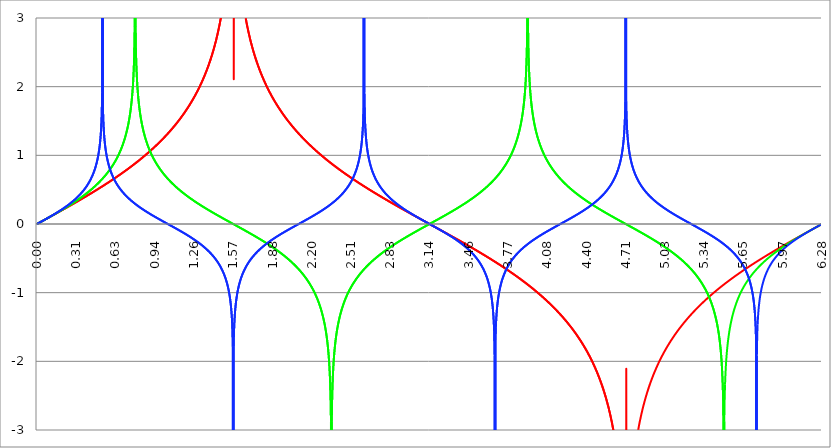
| Category | Series 1 | Series 0 | Series 2 |
|---|---|---|---|
| 0.0 | 0 | 0 | 0 |
| 0.00314159265358979 | 0.003 | 0.003 | 0.003 |
| 0.00628318530717958 | 0.006 | 0.006 | 0.006 |
| 0.00942477796076938 | 0.009 | 0.009 | 0.009 |
| 0.0125663706143592 | 0.013 | 0.013 | 0.013 |
| 0.015707963267949 | 0.016 | 0.016 | 0.016 |
| 0.0188495559215388 | 0.019 | 0.019 | 0.019 |
| 0.0219911485751285 | 0.022 | 0.022 | 0.022 |
| 0.0251327412287183 | 0.025 | 0.025 | 0.025 |
| 0.0282743338823081 | 0.028 | 0.028 | 0.028 |
| 0.0314159265358979 | 0.031 | 0.031 | 0.031 |
| 0.0345575191894877 | 0.035 | 0.035 | 0.035 |
| 0.0376991118430775 | 0.038 | 0.038 | 0.038 |
| 0.0408407044966673 | 0.041 | 0.041 | 0.041 |
| 0.0439822971502571 | 0.044 | 0.044 | 0.044 |
| 0.0471238898038469 | 0.047 | 0.047 | 0.047 |
| 0.0502654824574367 | 0.05 | 0.05 | 0.05 |
| 0.0534070751110265 | 0.053 | 0.054 | 0.054 |
| 0.0565486677646163 | 0.057 | 0.057 | 0.057 |
| 0.059690260418206 | 0.06 | 0.06 | 0.06 |
| 0.0628318530717958 | 0.063 | 0.063 | 0.063 |
| 0.0659734457253856 | 0.066 | 0.066 | 0.066 |
| 0.0691150383789754 | 0.069 | 0.069 | 0.07 |
| 0.0722566310325652 | 0.072 | 0.073 | 0.073 |
| 0.075398223686155 | 0.075 | 0.076 | 0.076 |
| 0.0785398163397448 | 0.079 | 0.079 | 0.079 |
| 0.0816814089933346 | 0.082 | 0.082 | 0.083 |
| 0.0848230016469244 | 0.085 | 0.085 | 0.086 |
| 0.0879645943005142 | 0.088 | 0.088 | 0.089 |
| 0.091106186954104 | 0.091 | 0.092 | 0.092 |
| 0.0942477796076937 | 0.094 | 0.095 | 0.096 |
| 0.0973893722612835 | 0.098 | 0.098 | 0.099 |
| 0.100530964914873 | 0.101 | 0.101 | 0.102 |
| 0.103672557568463 | 0.104 | 0.104 | 0.105 |
| 0.106814150222053 | 0.107 | 0.108 | 0.109 |
| 0.109955742875643 | 0.11 | 0.111 | 0.112 |
| 0.113097335529233 | 0.113 | 0.114 | 0.115 |
| 0.116238928182822 | 0.117 | 0.117 | 0.119 |
| 0.119380520836412 | 0.12 | 0.121 | 0.122 |
| 0.122522113490002 | 0.123 | 0.124 | 0.125 |
| 0.125663706143592 | 0.126 | 0.127 | 0.129 |
| 0.128805298797181 | 0.129 | 0.13 | 0.132 |
| 0.131946891450771 | 0.132 | 0.134 | 0.136 |
| 0.135088484104361 | 0.136 | 0.137 | 0.139 |
| 0.138230076757951 | 0.139 | 0.14 | 0.142 |
| 0.141371669411541 | 0.142 | 0.143 | 0.146 |
| 0.14451326206513 | 0.145 | 0.147 | 0.149 |
| 0.14765485471872 | 0.148 | 0.15 | 0.153 |
| 0.15079644737231 | 0.151 | 0.153 | 0.156 |
| 0.1539380400259 | 0.155 | 0.156 | 0.16 |
| 0.15707963267949 | 0.158 | 0.16 | 0.163 |
| 0.160221225333079 | 0.161 | 0.163 | 0.167 |
| 0.163362817986669 | 0.164 | 0.166 | 0.17 |
| 0.166504410640259 | 0.167 | 0.17 | 0.174 |
| 0.169646003293849 | 0.17 | 0.173 | 0.177 |
| 0.172787595947439 | 0.174 | 0.176 | 0.181 |
| 0.175929188601028 | 0.177 | 0.18 | 0.185 |
| 0.179070781254618 | 0.18 | 0.183 | 0.188 |
| 0.182212373908208 | 0.183 | 0.186 | 0.192 |
| 0.185353966561798 | 0.186 | 0.19 | 0.196 |
| 0.188495559215388 | 0.19 | 0.193 | 0.199 |
| 0.191637151868977 | 0.193 | 0.197 | 0.203 |
| 0.194778744522567 | 0.196 | 0.2 | 0.207 |
| 0.197920337176157 | 0.199 | 0.203 | 0.211 |
| 0.201061929829747 | 0.202 | 0.207 | 0.214 |
| 0.204203522483336 | 0.206 | 0.21 | 0.218 |
| 0.207345115136926 | 0.209 | 0.214 | 0.222 |
| 0.210486707790516 | 0.212 | 0.217 | 0.226 |
| 0.213628300444106 | 0.215 | 0.22 | 0.23 |
| 0.216769893097696 | 0.218 | 0.224 | 0.234 |
| 0.219911485751285 | 0.222 | 0.227 | 0.238 |
| 0.223053078404875 | 0.225 | 0.231 | 0.242 |
| 0.226194671058465 | 0.228 | 0.234 | 0.246 |
| 0.229336263712055 | 0.231 | 0.238 | 0.25 |
| 0.232477856365645 | 0.235 | 0.241 | 0.254 |
| 0.235619449019234 | 0.238 | 0.245 | 0.258 |
| 0.238761041672824 | 0.241 | 0.248 | 0.262 |
| 0.241902634326414 | 0.244 | 0.252 | 0.266 |
| 0.245044226980004 | 0.248 | 0.255 | 0.271 |
| 0.248185819633594 | 0.251 | 0.259 | 0.275 |
| 0.251327412287183 | 0.254 | 0.263 | 0.279 |
| 0.254469004940773 | 0.257 | 0.266 | 0.284 |
| 0.257610597594363 | 0.261 | 0.27 | 0.288 |
| 0.260752190247953 | 0.264 | 0.273 | 0.292 |
| 0.263893782901543 | 0.267 | 0.277 | 0.297 |
| 0.267035375555132 | 0.27 | 0.281 | 0.301 |
| 0.270176968208722 | 0.274 | 0.284 | 0.306 |
| 0.273318560862312 | 0.277 | 0.288 | 0.31 |
| 0.276460153515902 | 0.28 | 0.292 | 0.315 |
| 0.279601746169492 | 0.283 | 0.295 | 0.32 |
| 0.282743338823082 | 0.287 | 0.299 | 0.324 |
| 0.285884931476671 | 0.29 | 0.303 | 0.329 |
| 0.289026524130261 | 0.293 | 0.307 | 0.334 |
| 0.292168116783851 | 0.296 | 0.31 | 0.339 |
| 0.295309709437441 | 0.3 | 0.314 | 0.344 |
| 0.298451302091031 | 0.303 | 0.318 | 0.349 |
| 0.30159289474462 | 0.306 | 0.322 | 0.354 |
| 0.30473448739821 | 0.31 | 0.326 | 0.359 |
| 0.3078760800518 | 0.313 | 0.329 | 0.364 |
| 0.31101767270539 | 0.316 | 0.333 | 0.369 |
| 0.31415926535898 | 0.319 | 0.337 | 0.375 |
| 0.31730085801257 | 0.323 | 0.341 | 0.38 |
| 0.320442450666159 | 0.326 | 0.345 | 0.386 |
| 0.323584043319749 | 0.329 | 0.349 | 0.391 |
| 0.326725635973339 | 0.333 | 0.353 | 0.397 |
| 0.329867228626929 | 0.336 | 0.357 | 0.402 |
| 0.333008821280519 | 0.339 | 0.361 | 0.408 |
| 0.336150413934108 | 0.343 | 0.365 | 0.414 |
| 0.339292006587698 | 0.346 | 0.369 | 0.42 |
| 0.342433599241288 | 0.349 | 0.373 | 0.426 |
| 0.345575191894878 | 0.353 | 0.377 | 0.432 |
| 0.348716784548468 | 0.356 | 0.381 | 0.438 |
| 0.351858377202058 | 0.359 | 0.385 | 0.445 |
| 0.354999969855647 | 0.363 | 0.389 | 0.451 |
| 0.358141562509237 | 0.366 | 0.393 | 0.458 |
| 0.361283155162827 | 0.369 | 0.398 | 0.464 |
| 0.364424747816417 | 0.373 | 0.402 | 0.471 |
| 0.367566340470007 | 0.376 | 0.406 | 0.478 |
| 0.370707933123597 | 0.38 | 0.41 | 0.485 |
| 0.373849525777186 | 0.383 | 0.415 | 0.492 |
| 0.376991118430776 | 0.386 | 0.419 | 0.499 |
| 0.380132711084366 | 0.39 | 0.423 | 0.507 |
| 0.383274303737956 | 0.393 | 0.427 | 0.514 |
| 0.386415896391546 | 0.396 | 0.432 | 0.522 |
| 0.389557489045135 | 0.4 | 0.436 | 0.53 |
| 0.392699081698725 | 0.403 | 0.441 | 0.538 |
| 0.395840674352315 | 0.407 | 0.445 | 0.547 |
| 0.398982267005905 | 0.41 | 0.45 | 0.555 |
| 0.402123859659495 | 0.413 | 0.454 | 0.564 |
| 0.405265452313085 | 0.417 | 0.459 | 0.573 |
| 0.408407044966674 | 0.42 | 0.463 | 0.582 |
| 0.411548637620264 | 0.424 | 0.468 | 0.591 |
| 0.414690230273854 | 0.427 | 0.473 | 0.601 |
| 0.417831822927444 | 0.431 | 0.477 | 0.611 |
| 0.420973415581034 | 0.434 | 0.482 | 0.621 |
| 0.424115008234623 | 0.437 | 0.487 | 0.632 |
| 0.427256600888213 | 0.441 | 0.491 | 0.642 |
| 0.430398193541803 | 0.444 | 0.496 | 0.654 |
| 0.433539786195393 | 0.448 | 0.501 | 0.665 |
| 0.436681378848983 | 0.451 | 0.506 | 0.677 |
| 0.439822971502573 | 0.455 | 0.511 | 0.69 |
| 0.442964564156162 | 0.458 | 0.516 | 0.702 |
| 0.446106156809752 | 0.462 | 0.521 | 0.716 |
| 0.449247749463342 | 0.465 | 0.526 | 0.73 |
| 0.452389342116932 | 0.469 | 0.531 | 0.744 |
| 0.455530934770522 | 0.472 | 0.536 | 0.759 |
| 0.458672527424111 | 0.476 | 0.541 | 0.775 |
| 0.461814120077701 | 0.479 | 0.546 | 0.792 |
| 0.464955712731291 | 0.483 | 0.551 | 0.809 |
| 0.468097305384881 | 0.486 | 0.557 | 0.828 |
| 0.471238898038471 | 0.49 | 0.562 | 0.847 |
| 0.474380490692061 | 0.493 | 0.567 | 0.868 |
| 0.47752208334565 | 0.497 | 0.573 | 0.89 |
| 0.48066367599924 | 0.5 | 0.578 | 0.914 |
| 0.48380526865283 | 0.504 | 0.584 | 0.939 |
| 0.48694686130642 | 0.507 | 0.589 | 0.967 |
| 0.49008845396001 | 0.511 | 0.595 | 0.997 |
| 0.493230046613599 | 0.515 | 0.601 | 1.029 |
| 0.496371639267189 | 0.518 | 0.606 | 1.066 |
| 0.499513231920779 | 0.522 | 0.612 | 1.107 |
| 0.502654824574369 | 0.525 | 0.618 | 1.153 |
| 0.505796417227959 | 0.529 | 0.624 | 1.208 |
| 0.508938009881549 | 0.532 | 0.63 | 1.272 |
| 0.512079602535138 | 0.536 | 0.636 | 1.353 |
| 0.515221195188728 | 0.54 | 0.642 | 1.459 |
| 0.518362787842318 | 0.543 | 0.648 | 1.616 |
| 0.521504380495908 | 0.547 | 0.654 | 1.921 |
| 0.524645973149498 | 0.551 | 0.661 | 100 |
| 0.527787565803087 | 0.554 | 0.667 | 1.69 |
| 0.530929158456677 | 0.558 | 0.673 | 1.503 |
| 0.534070751110267 | 0.561 | 0.68 | 1.385 |
| 0.537212343763857 | 0.565 | 0.686 | 1.297 |
| 0.540353936417447 | 0.569 | 0.693 | 1.228 |
| 0.543495529071037 | 0.572 | 0.7 | 1.17 |
| 0.546637121724626 | 0.576 | 0.707 | 1.122 |
| 0.549778714378216 | 0.58 | 0.713 | 1.079 |
| 0.552920307031806 | 0.583 | 0.72 | 1.041 |
| 0.556061899685396 | 0.587 | 0.727 | 1.007 |
| 0.559203492338986 | 0.591 | 0.735 | 0.976 |
| 0.562345084992576 | 0.595 | 0.742 | 0.948 |
| 0.565486677646165 | 0.598 | 0.749 | 0.922 |
| 0.568628270299755 | 0.602 | 0.757 | 0.898 |
| 0.571769862953345 | 0.606 | 0.764 | 0.875 |
| 0.574911455606935 | 0.609 | 0.772 | 0.854 |
| 0.578053048260525 | 0.613 | 0.779 | 0.834 |
| 0.581194640914114 | 0.617 | 0.787 | 0.815 |
| 0.584336233567704 | 0.621 | 0.795 | 0.798 |
| 0.587477826221294 | 0.625 | 0.803 | 0.781 |
| 0.590619418874884 | 0.628 | 0.812 | 0.765 |
| 0.593761011528474 | 0.632 | 0.82 | 0.749 |
| 0.596902604182064 | 0.636 | 0.828 | 0.735 |
| 0.600044196835653 | 0.64 | 0.837 | 0.72 |
| 0.603185789489243 | 0.643 | 0.846 | 0.707 |
| 0.606327382142833 | 0.647 | 0.855 | 0.694 |
| 0.609468974796423 | 0.651 | 0.864 | 0.681 |
| 0.612610567450013 | 0.655 | 0.873 | 0.669 |
| 0.615752160103602 | 0.659 | 0.882 | 0.657 |
| 0.618893752757192 | 0.663 | 0.892 | 0.646 |
| 0.622035345410782 | 0.667 | 0.901 | 0.635 |
| 0.625176938064372 | 0.67 | 0.911 | 0.625 |
| 0.628318530717962 | 0.674 | 0.921 | 0.614 |
| 0.631460123371551 | 0.678 | 0.932 | 0.604 |
| 0.634601716025141 | 0.682 | 0.942 | 0.594 |
| 0.637743308678731 | 0.686 | 0.953 | 0.585 |
| 0.640884901332321 | 0.69 | 0.964 | 0.576 |
| 0.644026493985911 | 0.694 | 0.975 | 0.567 |
| 0.647168086639501 | 0.698 | 0.986 | 0.558 |
| 0.65030967929309 | 0.702 | 0.998 | 0.549 |
| 0.65345127194668 | 0.706 | 1.01 | 0.541 |
| 0.65659286460027 | 0.71 | 1.022 | 0.533 |
| 0.65973445725386 | 0.714 | 1.034 | 0.525 |
| 0.66287604990745 | 0.718 | 1.047 | 0.517 |
| 0.666017642561039 | 0.722 | 1.06 | 0.509 |
| 0.669159235214629 | 0.726 | 1.074 | 0.502 |
| 0.672300827868219 | 0.73 | 1.088 | 0.495 |
| 0.675442420521809 | 0.734 | 1.102 | 0.487 |
| 0.678584013175399 | 0.738 | 1.116 | 0.48 |
| 0.681725605828989 | 0.742 | 1.131 | 0.473 |
| 0.684867198482578 | 0.746 | 1.147 | 0.466 |
| 0.688008791136168 | 0.75 | 1.163 | 0.46 |
| 0.691150383789758 | 0.754 | 1.179 | 0.453 |
| 0.694291976443348 | 0.758 | 1.196 | 0.447 |
| 0.697433569096938 | 0.762 | 1.214 | 0.44 |
| 0.700575161750528 | 0.766 | 1.232 | 0.434 |
| 0.703716754404117 | 0.77 | 1.251 | 0.428 |
| 0.706858347057707 | 0.774 | 1.271 | 0.422 |
| 0.709999939711297 | 0.778 | 1.292 | 0.416 |
| 0.713141532364887 | 0.783 | 1.313 | 0.41 |
| 0.716283125018477 | 0.787 | 1.335 | 0.404 |
| 0.719424717672066 | 0.791 | 1.359 | 0.399 |
| 0.722566310325656 | 0.795 | 1.383 | 0.393 |
| 0.725707902979246 | 0.799 | 1.409 | 0.387 |
| 0.728849495632836 | 0.804 | 1.436 | 0.382 |
| 0.731991088286426 | 0.808 | 1.464 | 0.377 |
| 0.735132680940016 | 0.812 | 1.495 | 0.371 |
| 0.738274273593605 | 0.816 | 1.527 | 0.366 |
| 0.741415866247195 | 0.82 | 1.562 | 0.361 |
| 0.744557458900785 | 0.825 | 1.599 | 0.356 |
| 0.747699051554375 | 0.829 | 1.639 | 0.351 |
| 0.750840644207965 | 0.833 | 1.682 | 0.345 |
| 0.753982236861554 | 0.838 | 1.73 | 0.341 |
| 0.757123829515144 | 0.842 | 1.783 | 0.336 |
| 0.760265422168734 | 0.846 | 1.842 | 0.331 |
| 0.763407014822324 | 0.851 | 1.908 | 0.326 |
| 0.766548607475914 | 0.855 | 1.986 | 0.321 |
| 0.769690200129504 | 0.859 | 2.077 | 0.317 |
| 0.772831792783093 | 0.864 | 2.188 | 0.312 |
| 0.775973385436683 | 0.868 | 2.332 | 0.307 |
| 0.779114978090273 | 0.873 | 2.535 | 0.303 |
| 0.782256570743863 | 0.877 | 2.882 | 0.298 |
| 0.785398163397453 | 0.881 | 100 | 0.294 |
| 0.788539756051042 | 0.886 | 2.882 | 0.289 |
| 0.791681348704632 | 0.89 | 2.535 | 0.285 |
| 0.794822941358222 | 0.895 | 2.332 | 0.281 |
| 0.797964534011812 | 0.899 | 2.188 | 0.276 |
| 0.801106126665402 | 0.904 | 2.077 | 0.272 |
| 0.804247719318992 | 0.908 | 1.986 | 0.268 |
| 0.807389311972581 | 0.913 | 1.908 | 0.264 |
| 0.810530904626171 | 0.917 | 1.842 | 0.259 |
| 0.813672497279761 | 0.922 | 1.783 | 0.255 |
| 0.816814089933351 | 0.927 | 1.73 | 0.251 |
| 0.819955682586941 | 0.931 | 1.682 | 0.247 |
| 0.823097275240531 | 0.936 | 1.639 | 0.243 |
| 0.82623886789412 | 0.94 | 1.599 | 0.239 |
| 0.82938046054771 | 0.945 | 1.562 | 0.235 |
| 0.8325220532013 | 0.95 | 1.527 | 0.231 |
| 0.83566364585489 | 0.954 | 1.495 | 0.227 |
| 0.83880523850848 | 0.959 | 1.464 | 0.223 |
| 0.841946831162069 | 0.964 | 1.436 | 0.22 |
| 0.845088423815659 | 0.968 | 1.409 | 0.216 |
| 0.848230016469249 | 0.973 | 1.383 | 0.212 |
| 0.851371609122839 | 0.978 | 1.359 | 0.208 |
| 0.854513201776429 | 0.983 | 1.335 | 0.204 |
| 0.857654794430019 | 0.988 | 1.313 | 0.201 |
| 0.860796387083608 | 0.992 | 1.292 | 0.197 |
| 0.863937979737198 | 0.997 | 1.271 | 0.193 |
| 0.867079572390788 | 1.002 | 1.251 | 0.19 |
| 0.870221165044378 | 1.007 | 1.232 | 0.186 |
| 0.873362757697968 | 1.012 | 1.214 | 0.182 |
| 0.876504350351557 | 1.017 | 1.196 | 0.179 |
| 0.879645943005147 | 1.022 | 1.179 | 0.175 |
| 0.882787535658737 | 1.027 | 1.163 | 0.172 |
| 0.885929128312327 | 1.031 | 1.147 | 0.168 |
| 0.889070720965917 | 1.036 | 1.131 | 0.164 |
| 0.892212313619507 | 1.041 | 1.116 | 0.161 |
| 0.895353906273096 | 1.046 | 1.102 | 0.157 |
| 0.898495498926686 | 1.052 | 1.088 | 0.154 |
| 0.901637091580276 | 1.057 | 1.074 | 0.15 |
| 0.904778684233866 | 1.062 | 1.06 | 0.147 |
| 0.907920276887456 | 1.067 | 1.047 | 0.144 |
| 0.911061869541045 | 1.072 | 1.034 | 0.14 |
| 0.914203462194635 | 1.077 | 1.022 | 0.137 |
| 0.917345054848225 | 1.082 | 1.01 | 0.133 |
| 0.920486647501815 | 1.087 | 0.998 | 0.13 |
| 0.923628240155405 | 1.093 | 0.986 | 0.127 |
| 0.926769832808995 | 1.098 | 0.975 | 0.123 |
| 0.929911425462584 | 1.103 | 0.964 | 0.12 |
| 0.933053018116174 | 1.108 | 0.953 | 0.116 |
| 0.936194610769764 | 1.114 | 0.942 | 0.113 |
| 0.939336203423354 | 1.119 | 0.932 | 0.11 |
| 0.942477796076944 | 1.124 | 0.921 | 0.106 |
| 0.945619388730533 | 1.13 | 0.911 | 0.103 |
| 0.948760981384123 | 1.135 | 0.901 | 0.1 |
| 0.951902574037713 | 1.14 | 0.892 | 0.097 |
| 0.955044166691303 | 1.146 | 0.882 | 0.093 |
| 0.958185759344893 | 1.151 | 0.873 | 0.09 |
| 0.961327351998483 | 1.157 | 0.864 | 0.087 |
| 0.964468944652072 | 1.162 | 0.855 | 0.084 |
| 0.967610537305662 | 1.168 | 0.846 | 0.08 |
| 0.970752129959252 | 1.173 | 0.837 | 0.077 |
| 0.973893722612842 | 1.179 | 0.828 | 0.074 |
| 0.977035315266432 | 1.184 | 0.82 | 0.071 |
| 0.980176907920022 | 1.19 | 0.812 | 0.067 |
| 0.983318500573611 | 1.196 | 0.803 | 0.064 |
| 0.986460093227201 | 1.201 | 0.795 | 0.061 |
| 0.989601685880791 | 1.207 | 0.787 | 0.058 |
| 0.992743278534381 | 1.213 | 0.779 | 0.055 |
| 0.995884871187971 | 1.219 | 0.772 | 0.052 |
| 0.99902646384156 | 1.224 | 0.764 | 0.048 |
| 1.00216805649515 | 1.23 | 0.757 | 0.045 |
| 1.00530964914874 | 1.236 | 0.749 | 0.042 |
| 1.00845124180233 | 1.242 | 0.742 | 0.039 |
| 1.01159283445592 | 1.248 | 0.735 | 0.036 |
| 1.01473442710951 | 1.254 | 0.727 | 0.033 |
| 1.017876019763099 | 1.26 | 0.72 | 0.029 |
| 1.021017612416689 | 1.266 | 0.713 | 0.026 |
| 1.02415920507028 | 1.272 | 0.707 | 0.023 |
| 1.027300797723869 | 1.278 | 0.7 | 0.02 |
| 1.030442390377459 | 1.284 | 0.693 | 0.017 |
| 1.033583983031048 | 1.29 | 0.686 | 0.014 |
| 1.036725575684638 | 1.296 | 0.68 | 0.01 |
| 1.039867168338228 | 1.302 | 0.673 | 0.007 |
| 1.043008760991818 | 1.309 | 0.667 | 0.004 |
| 1.046150353645408 | 1.315 | 0.661 | 0.001 |
| 1.049291946298998 | 1.321 | 0.654 | -0.002 |
| 1.052433538952587 | 1.327 | 0.648 | -0.005 |
| 1.055575131606177 | 1.334 | 0.642 | -0.008 |
| 1.058716724259767 | 1.34 | 0.636 | -0.012 |
| 1.061858316913357 | 1.347 | 0.63 | -0.015 |
| 1.064999909566947 | 1.353 | 0.624 | -0.018 |
| 1.068141502220536 | 1.36 | 0.618 | -0.021 |
| 1.071283094874126 | 1.366 | 0.612 | -0.024 |
| 1.074424687527716 | 1.373 | 0.606 | -0.027 |
| 1.077566280181306 | 1.379 | 0.601 | -0.03 |
| 1.080707872834896 | 1.386 | 0.595 | -0.034 |
| 1.083849465488486 | 1.393 | 0.589 | -0.037 |
| 1.086991058142075 | 1.399 | 0.584 | -0.04 |
| 1.090132650795665 | 1.406 | 0.578 | -0.043 |
| 1.093274243449255 | 1.413 | 0.573 | -0.046 |
| 1.096415836102845 | 1.42 | 0.567 | -0.049 |
| 1.099557428756435 | 1.427 | 0.562 | -0.053 |
| 1.102699021410025 | 1.434 | 0.557 | -0.056 |
| 1.105840614063614 | 1.441 | 0.551 | -0.059 |
| 1.108982206717204 | 1.448 | 0.546 | -0.062 |
| 1.112123799370794 | 1.455 | 0.541 | -0.065 |
| 1.115265392024384 | 1.462 | 0.536 | -0.069 |
| 1.118406984677974 | 1.469 | 0.531 | -0.072 |
| 1.121548577331563 | 1.476 | 0.526 | -0.075 |
| 1.124690169985153 | 1.484 | 0.521 | -0.078 |
| 1.127831762638743 | 1.491 | 0.516 | -0.081 |
| 1.130973355292333 | 1.498 | 0.511 | -0.085 |
| 1.134114947945923 | 1.506 | 0.506 | -0.088 |
| 1.137256540599513 | 1.513 | 0.501 | -0.091 |
| 1.140398133253102 | 1.521 | 0.496 | -0.094 |
| 1.143539725906692 | 1.528 | 0.491 | -0.098 |
| 1.146681318560282 | 1.536 | 0.487 | -0.101 |
| 1.149822911213872 | 1.543 | 0.482 | -0.104 |
| 1.152964503867462 | 1.551 | 0.477 | -0.108 |
| 1.156106096521051 | 1.559 | 0.473 | -0.111 |
| 1.159247689174641 | 1.567 | 0.468 | -0.114 |
| 1.162389281828231 | 1.575 | 0.463 | -0.118 |
| 1.165530874481821 | 1.583 | 0.459 | -0.121 |
| 1.168672467135411 | 1.591 | 0.454 | -0.124 |
| 1.171814059789001 | 1.599 | 0.45 | -0.128 |
| 1.17495565244259 | 1.607 | 0.445 | -0.131 |
| 1.17809724509618 | 1.615 | 0.441 | -0.134 |
| 1.18123883774977 | 1.623 | 0.436 | -0.138 |
| 1.18438043040336 | 1.631 | 0.432 | -0.141 |
| 1.18752202305695 | 1.64 | 0.427 | -0.145 |
| 1.190663615710539 | 1.648 | 0.423 | -0.148 |
| 1.193805208364129 | 1.657 | 0.419 | -0.152 |
| 1.19694680101772 | 1.665 | 0.415 | -0.155 |
| 1.200088393671309 | 1.674 | 0.41 | -0.159 |
| 1.203229986324899 | 1.683 | 0.406 | -0.162 |
| 1.206371578978489 | 1.691 | 0.402 | -0.166 |
| 1.209513171632078 | 1.7 | 0.398 | -0.169 |
| 1.212654764285668 | 1.709 | 0.393 | -0.173 |
| 1.215796356939258 | 1.718 | 0.389 | -0.176 |
| 1.218937949592848 | 1.727 | 0.385 | -0.18 |
| 1.222079542246438 | 1.736 | 0.381 | -0.184 |
| 1.225221134900027 | 1.746 | 0.377 | -0.187 |
| 1.228362727553617 | 1.755 | 0.373 | -0.191 |
| 1.231504320207207 | 1.764 | 0.369 | -0.194 |
| 1.234645912860797 | 1.774 | 0.365 | -0.198 |
| 1.237787505514387 | 1.783 | 0.361 | -0.202 |
| 1.240929098167977 | 1.793 | 0.357 | -0.206 |
| 1.244070690821566 | 1.803 | 0.353 | -0.209 |
| 1.247212283475156 | 1.813 | 0.349 | -0.213 |
| 1.250353876128746 | 1.823 | 0.345 | -0.217 |
| 1.253495468782336 | 1.833 | 0.341 | -0.221 |
| 1.256637061435926 | 1.843 | 0.337 | -0.225 |
| 1.259778654089515 | 1.853 | 0.333 | -0.229 |
| 1.262920246743105 | 1.863 | 0.329 | -0.233 |
| 1.266061839396695 | 1.874 | 0.326 | -0.237 |
| 1.269203432050285 | 1.884 | 0.322 | -0.241 |
| 1.272345024703875 | 1.895 | 0.318 | -0.245 |
| 1.275486617357465 | 1.906 | 0.314 | -0.249 |
| 1.278628210011054 | 1.916 | 0.31 | -0.253 |
| 1.281769802664644 | 1.927 | 0.307 | -0.257 |
| 1.284911395318234 | 1.938 | 0.303 | -0.261 |
| 1.288052987971824 | 1.95 | 0.299 | -0.265 |
| 1.291194580625414 | 1.961 | 0.295 | -0.269 |
| 1.294336173279003 | 1.972 | 0.292 | -0.273 |
| 1.297477765932593 | 1.984 | 0.288 | -0.278 |
| 1.300619358586183 | 1.996 | 0.284 | -0.282 |
| 1.303760951239773 | 2.008 | 0.281 | -0.286 |
| 1.306902543893363 | 2.02 | 0.277 | -0.291 |
| 1.310044136546953 | 2.032 | 0.273 | -0.295 |
| 1.313185729200542 | 2.044 | 0.27 | -0.3 |
| 1.316327321854132 | 2.056 | 0.266 | -0.304 |
| 1.319468914507722 | 2.069 | 0.263 | -0.309 |
| 1.322610507161312 | 2.082 | 0.259 | -0.313 |
| 1.325752099814902 | 2.094 | 0.255 | -0.318 |
| 1.328893692468491 | 2.107 | 0.252 | -0.323 |
| 1.332035285122081 | 2.121 | 0.248 | -0.328 |
| 1.335176877775671 | 2.134 | 0.245 | -0.332 |
| 1.338318470429261 | 2.148 | 0.241 | -0.337 |
| 1.341460063082851 | 2.161 | 0.238 | -0.342 |
| 1.344601655736441 | 2.175 | 0.234 | -0.347 |
| 1.34774324839003 | 2.189 | 0.231 | -0.352 |
| 1.35088484104362 | 2.204 | 0.227 | -0.357 |
| 1.35402643369721 | 2.218 | 0.224 | -0.362 |
| 1.3571680263508 | 2.233 | 0.22 | -0.368 |
| 1.36030961900439 | 2.248 | 0.217 | -0.373 |
| 1.363451211657979 | 2.263 | 0.214 | -0.378 |
| 1.36659280431157 | 2.278 | 0.21 | -0.384 |
| 1.369734396965159 | 2.294 | 0.207 | -0.389 |
| 1.372875989618749 | 2.31 | 0.203 | -0.395 |
| 1.376017582272339 | 2.326 | 0.2 | -0.4 |
| 1.379159174925929 | 2.342 | 0.197 | -0.406 |
| 1.382300767579518 | 2.359 | 0.193 | -0.412 |
| 1.385442360233108 | 2.376 | 0.19 | -0.418 |
| 1.388583952886698 | 2.393 | 0.186 | -0.424 |
| 1.391725545540288 | 2.41 | 0.183 | -0.43 |
| 1.394867138193878 | 2.428 | 0.18 | -0.436 |
| 1.398008730847468 | 2.446 | 0.176 | -0.442 |
| 1.401150323501057 | 2.465 | 0.173 | -0.449 |
| 1.404291916154647 | 2.484 | 0.17 | -0.455 |
| 1.407433508808237 | 2.503 | 0.166 | -0.462 |
| 1.410575101461827 | 2.522 | 0.163 | -0.469 |
| 1.413716694115417 | 2.542 | 0.16 | -0.476 |
| 1.416858286769006 | 2.562 | 0.156 | -0.483 |
| 1.419999879422596 | 2.583 | 0.153 | -0.49 |
| 1.423141472076186 | 2.604 | 0.15 | -0.497 |
| 1.426283064729776 | 2.626 | 0.147 | -0.504 |
| 1.429424657383366 | 2.648 | 0.143 | -0.512 |
| 1.432566250036956 | 2.67 | 0.14 | -0.52 |
| 1.435707842690545 | 2.693 | 0.137 | -0.528 |
| 1.438849435344135 | 2.717 | 0.134 | -0.536 |
| 1.441991027997725 | 2.741 | 0.13 | -0.544 |
| 1.445132620651315 | 2.766 | 0.127 | -0.552 |
| 1.448274213304905 | 2.791 | 0.124 | -0.561 |
| 1.451415805958494 | 2.817 | 0.121 | -0.57 |
| 1.454557398612084 | 2.844 | 0.117 | -0.579 |
| 1.457698991265674 | 2.872 | 0.114 | -0.588 |
| 1.460840583919264 | 2.9 | 0.111 | -0.598 |
| 1.463982176572854 | 2.929 | 0.108 | -0.608 |
| 1.467123769226444 | 2.959 | 0.104 | -0.618 |
| 1.470265361880033 | 2.99 | 0.101 | -0.628 |
| 1.473406954533623 | 3.021 | 0.098 | -0.639 |
| 1.476548547187213 | 3.054 | 0.095 | -0.65 |
| 1.479690139840803 | 3.088 | 0.092 | -0.661 |
| 1.482831732494393 | 3.123 | 0.088 | -0.673 |
| 1.485973325147982 | 3.16 | 0.085 | -0.685 |
| 1.489114917801572 | 3.198 | 0.082 | -0.698 |
| 1.492256510455162 | 3.237 | 0.079 | -0.711 |
| 1.495398103108752 | 3.278 | 0.076 | -0.725 |
| 1.498539695762342 | 3.32 | 0.073 | -0.739 |
| 1.501681288415932 | 3.365 | 0.069 | -0.754 |
| 1.504822881069521 | 3.411 | 0.066 | -0.77 |
| 1.507964473723111 | 3.46 | 0.063 | -0.786 |
| 1.511106066376701 | 3.511 | 0.06 | -0.803 |
| 1.514247659030291 | 3.566 | 0.057 | -0.822 |
| 1.517389251683881 | 3.623 | 0.054 | -0.841 |
| 1.520530844337471 | 3.683 | 0.05 | -0.861 |
| 1.52367243699106 | 3.748 | 0.047 | -0.883 |
| 1.52681402964465 | 3.817 | 0.044 | -0.906 |
| 1.52995562229824 | 3.891 | 0.041 | -0.93 |
| 1.53309721495183 | 3.971 | 0.038 | -0.957 |
| 1.53623880760542 | 4.058 | 0.035 | -0.986 |
| 1.539380400259009 | 4.154 | 0.031 | -1.018 |
| 1.542521992912599 | 4.259 | 0.028 | -1.053 |
| 1.545663585566189 | 4.377 | 0.025 | -1.093 |
| 1.548805178219779 | 4.51 | 0.022 | -1.137 |
| 1.551946770873369 | 4.664 | 0.019 | -1.189 |
| 1.555088363526959 | 4.847 | 0.016 | -1.249 |
| 1.558229956180548 | 5.07 | 0.013 | -1.324 |
| 1.561371548834138 | 5.358 | 0.009 | -1.42 |
| 1.564513141487728 | 5.763 | 0.006 | -1.555 |
| 1.567654734141318 | 6.456 | 0.003 | -1.786 |
| 1.570796326794908 | 100 | 0 | -100 |
| 1.573937919448497 | 6.456 | -0.003 | -1.786 |
| 1.577079512102087 | 5.763 | -0.006 | -1.555 |
| 1.580221104755677 | 5.358 | -0.009 | -1.42 |
| 1.583362697409267 | 5.07 | -0.013 | -1.324 |
| 1.586504290062857 | 4.847 | -0.016 | -1.249 |
| 1.589645882716447 | 4.664 | -0.019 | -1.189 |
| 1.592787475370036 | 4.51 | -0.022 | -1.137 |
| 1.595929068023626 | 4.377 | -0.025 | -1.093 |
| 1.599070660677216 | 4.259 | -0.028 | -1.053 |
| 1.602212253330806 | 4.154 | -0.031 | -1.018 |
| 1.605353845984396 | 4.058 | -0.035 | -0.986 |
| 1.608495438637985 | 3.971 | -0.038 | -0.957 |
| 1.611637031291575 | 3.891 | -0.041 | -0.93 |
| 1.614778623945165 | 3.817 | -0.044 | -0.906 |
| 1.617920216598755 | 3.748 | -0.047 | -0.883 |
| 1.621061809252345 | 3.683 | -0.05 | -0.861 |
| 1.624203401905935 | 3.623 | -0.054 | -0.841 |
| 1.627344994559524 | 3.566 | -0.057 | -0.822 |
| 1.630486587213114 | 3.511 | -0.06 | -0.803 |
| 1.633628179866704 | 3.46 | -0.063 | -0.786 |
| 1.636769772520294 | 3.411 | -0.066 | -0.77 |
| 1.639911365173884 | 3.365 | -0.069 | -0.754 |
| 1.643052957827473 | 3.32 | -0.073 | -0.739 |
| 1.646194550481063 | 3.278 | -0.076 | -0.725 |
| 1.649336143134653 | 3.237 | -0.079 | -0.711 |
| 1.652477735788243 | 3.198 | -0.082 | -0.698 |
| 1.655619328441833 | 3.16 | -0.085 | -0.685 |
| 1.658760921095423 | 3.123 | -0.088 | -0.673 |
| 1.661902513749012 | 3.088 | -0.092 | -0.661 |
| 1.665044106402602 | 3.054 | -0.095 | -0.65 |
| 1.668185699056192 | 3.021 | -0.098 | -0.639 |
| 1.671327291709782 | 2.99 | -0.101 | -0.628 |
| 1.674468884363372 | 2.959 | -0.104 | -0.618 |
| 1.677610477016961 | 2.929 | -0.108 | -0.608 |
| 1.680752069670551 | 2.9 | -0.111 | -0.598 |
| 1.683893662324141 | 2.872 | -0.114 | -0.588 |
| 1.687035254977731 | 2.844 | -0.117 | -0.579 |
| 1.690176847631321 | 2.817 | -0.121 | -0.57 |
| 1.693318440284911 | 2.791 | -0.124 | -0.561 |
| 1.6964600329385 | 2.766 | -0.127 | -0.552 |
| 1.69960162559209 | 2.741 | -0.13 | -0.544 |
| 1.70274321824568 | 2.717 | -0.134 | -0.536 |
| 1.70588481089927 | 2.693 | -0.137 | -0.528 |
| 1.70902640355286 | 2.67 | -0.14 | -0.52 |
| 1.712167996206449 | 2.648 | -0.143 | -0.512 |
| 1.715309588860039 | 2.626 | -0.147 | -0.504 |
| 1.71845118151363 | 2.604 | -0.15 | -0.497 |
| 1.721592774167219 | 2.583 | -0.153 | -0.49 |
| 1.724734366820809 | 2.562 | -0.156 | -0.483 |
| 1.727875959474399 | 2.542 | -0.16 | -0.476 |
| 1.731017552127988 | 2.522 | -0.163 | -0.469 |
| 1.734159144781578 | 2.503 | -0.166 | -0.462 |
| 1.737300737435168 | 2.484 | -0.17 | -0.455 |
| 1.740442330088758 | 2.465 | -0.173 | -0.449 |
| 1.743583922742348 | 2.446 | -0.176 | -0.442 |
| 1.746725515395937 | 2.428 | -0.18 | -0.436 |
| 1.749867108049527 | 2.41 | -0.183 | -0.43 |
| 1.753008700703117 | 2.393 | -0.186 | -0.424 |
| 1.756150293356707 | 2.376 | -0.19 | -0.418 |
| 1.759291886010297 | 2.359 | -0.193 | -0.412 |
| 1.762433478663887 | 2.342 | -0.197 | -0.406 |
| 1.765575071317476 | 2.326 | -0.2 | -0.4 |
| 1.768716663971066 | 2.31 | -0.203 | -0.395 |
| 1.771858256624656 | 2.294 | -0.207 | -0.389 |
| 1.774999849278246 | 2.278 | -0.21 | -0.384 |
| 1.778141441931836 | 2.263 | -0.214 | -0.378 |
| 1.781283034585426 | 2.248 | -0.217 | -0.373 |
| 1.784424627239015 | 2.233 | -0.22 | -0.368 |
| 1.787566219892605 | 2.218 | -0.224 | -0.362 |
| 1.790707812546195 | 2.204 | -0.227 | -0.357 |
| 1.793849405199785 | 2.189 | -0.231 | -0.352 |
| 1.796990997853375 | 2.175 | -0.234 | -0.347 |
| 1.800132590506964 | 2.161 | -0.238 | -0.342 |
| 1.803274183160554 | 2.148 | -0.241 | -0.337 |
| 1.806415775814144 | 2.134 | -0.245 | -0.332 |
| 1.809557368467734 | 2.121 | -0.248 | -0.328 |
| 1.812698961121324 | 2.107 | -0.252 | -0.323 |
| 1.815840553774914 | 2.094 | -0.255 | -0.318 |
| 1.818982146428503 | 2.082 | -0.259 | -0.313 |
| 1.822123739082093 | 2.069 | -0.263 | -0.309 |
| 1.825265331735683 | 2.056 | -0.266 | -0.304 |
| 1.828406924389273 | 2.044 | -0.27 | -0.3 |
| 1.831548517042863 | 2.032 | -0.273 | -0.295 |
| 1.834690109696452 | 2.02 | -0.277 | -0.291 |
| 1.837831702350042 | 2.008 | -0.281 | -0.286 |
| 1.840973295003632 | 1.996 | -0.284 | -0.282 |
| 1.844114887657222 | 1.984 | -0.288 | -0.278 |
| 1.847256480310812 | 1.972 | -0.292 | -0.273 |
| 1.850398072964402 | 1.961 | -0.295 | -0.269 |
| 1.853539665617991 | 1.95 | -0.299 | -0.265 |
| 1.856681258271581 | 1.938 | -0.303 | -0.261 |
| 1.859822850925171 | 1.927 | -0.307 | -0.257 |
| 1.862964443578761 | 1.916 | -0.31 | -0.253 |
| 1.866106036232351 | 1.906 | -0.314 | -0.249 |
| 1.86924762888594 | 1.895 | -0.318 | -0.245 |
| 1.87238922153953 | 1.884 | -0.322 | -0.241 |
| 1.87553081419312 | 1.874 | -0.326 | -0.237 |
| 1.87867240684671 | 1.863 | -0.329 | -0.233 |
| 1.8818139995003 | 1.853 | -0.333 | -0.229 |
| 1.88495559215389 | 1.843 | -0.337 | -0.225 |
| 1.888097184807479 | 1.833 | -0.341 | -0.221 |
| 1.891238777461069 | 1.823 | -0.345 | -0.217 |
| 1.89438037011466 | 1.813 | -0.349 | -0.213 |
| 1.897521962768249 | 1.803 | -0.353 | -0.209 |
| 1.900663555421839 | 1.793 | -0.357 | -0.206 |
| 1.903805148075429 | 1.783 | -0.361 | -0.202 |
| 1.906946740729018 | 1.774 | -0.365 | -0.198 |
| 1.910088333382608 | 1.764 | -0.369 | -0.194 |
| 1.913229926036198 | 1.755 | -0.373 | -0.191 |
| 1.916371518689788 | 1.746 | -0.377 | -0.187 |
| 1.919513111343378 | 1.736 | -0.381 | -0.184 |
| 1.922654703996967 | 1.727 | -0.385 | -0.18 |
| 1.925796296650557 | 1.718 | -0.389 | -0.176 |
| 1.928937889304147 | 1.709 | -0.393 | -0.173 |
| 1.932079481957737 | 1.7 | -0.398 | -0.169 |
| 1.935221074611327 | 1.691 | -0.402 | -0.166 |
| 1.938362667264917 | 1.683 | -0.406 | -0.162 |
| 1.941504259918506 | 1.674 | -0.41 | -0.159 |
| 1.944645852572096 | 1.665 | -0.415 | -0.155 |
| 1.947787445225686 | 1.657 | -0.419 | -0.152 |
| 1.950929037879276 | 1.648 | -0.423 | -0.148 |
| 1.954070630532866 | 1.64 | -0.427 | -0.145 |
| 1.957212223186455 | 1.631 | -0.432 | -0.141 |
| 1.960353815840045 | 1.623 | -0.436 | -0.138 |
| 1.963495408493635 | 1.615 | -0.441 | -0.134 |
| 1.966637001147225 | 1.607 | -0.445 | -0.131 |
| 1.969778593800815 | 1.599 | -0.45 | -0.128 |
| 1.972920186454405 | 1.591 | -0.454 | -0.124 |
| 1.976061779107994 | 1.583 | -0.459 | -0.121 |
| 1.979203371761584 | 1.575 | -0.463 | -0.118 |
| 1.982344964415174 | 1.567 | -0.468 | -0.114 |
| 1.985486557068764 | 1.559 | -0.473 | -0.111 |
| 1.988628149722354 | 1.551 | -0.477 | -0.108 |
| 1.991769742375943 | 1.543 | -0.482 | -0.104 |
| 1.994911335029533 | 1.536 | -0.487 | -0.101 |
| 1.998052927683123 | 1.528 | -0.491 | -0.098 |
| 2.001194520336712 | 1.521 | -0.496 | -0.094 |
| 2.004336112990302 | 1.513 | -0.501 | -0.091 |
| 2.007477705643892 | 1.506 | -0.506 | -0.088 |
| 2.010619298297482 | 1.498 | -0.511 | -0.085 |
| 2.013760890951071 | 1.491 | -0.516 | -0.081 |
| 2.016902483604661 | 1.484 | -0.521 | -0.078 |
| 2.02004407625825 | 1.476 | -0.526 | -0.075 |
| 2.02318566891184 | 1.469 | -0.531 | -0.072 |
| 2.02632726156543 | 1.462 | -0.536 | -0.069 |
| 2.029468854219019 | 1.455 | -0.541 | -0.065 |
| 2.032610446872609 | 1.448 | -0.546 | -0.062 |
| 2.035752039526198 | 1.441 | -0.551 | -0.059 |
| 2.038893632179788 | 1.434 | -0.557 | -0.056 |
| 2.042035224833378 | 1.427 | -0.562 | -0.053 |
| 2.045176817486967 | 1.42 | -0.567 | -0.049 |
| 2.048318410140557 | 1.413 | -0.573 | -0.046 |
| 2.051460002794146 | 1.406 | -0.578 | -0.043 |
| 2.054601595447736 | 1.399 | -0.584 | -0.04 |
| 2.057743188101325 | 1.393 | -0.589 | -0.037 |
| 2.060884780754915 | 1.386 | -0.595 | -0.034 |
| 2.064026373408505 | 1.379 | -0.601 | -0.03 |
| 2.067167966062094 | 1.373 | -0.606 | -0.027 |
| 2.070309558715684 | 1.366 | -0.612 | -0.024 |
| 2.073451151369273 | 1.36 | -0.618 | -0.021 |
| 2.076592744022863 | 1.353 | -0.624 | -0.018 |
| 2.079734336676452 | 1.347 | -0.63 | -0.015 |
| 2.082875929330042 | 1.34 | -0.636 | -0.012 |
| 2.086017521983632 | 1.334 | -0.642 | -0.008 |
| 2.089159114637221 | 1.327 | -0.648 | -0.005 |
| 2.092300707290811 | 1.321 | -0.654 | -0.002 |
| 2.095442299944401 | 1.315 | -0.661 | 0.001 |
| 2.09858389259799 | 1.309 | -0.667 | 0.004 |
| 2.10172548525158 | 1.302 | -0.673 | 0.007 |
| 2.104867077905169 | 1.296 | -0.68 | 0.01 |
| 2.108008670558759 | 1.29 | -0.686 | 0.014 |
| 2.111150263212349 | 1.284 | -0.693 | 0.017 |
| 2.114291855865938 | 1.278 | -0.7 | 0.02 |
| 2.117433448519528 | 1.272 | -0.707 | 0.023 |
| 2.120575041173117 | 1.266 | -0.713 | 0.026 |
| 2.123716633826707 | 1.26 | -0.72 | 0.029 |
| 2.126858226480297 | 1.254 | -0.727 | 0.033 |
| 2.129999819133886 | 1.248 | -0.735 | 0.036 |
| 2.133141411787476 | 1.242 | -0.742 | 0.039 |
| 2.136283004441065 | 1.236 | -0.749 | 0.042 |
| 2.139424597094655 | 1.23 | -0.757 | 0.045 |
| 2.142566189748245 | 1.224 | -0.764 | 0.048 |
| 2.145707782401834 | 1.219 | -0.772 | 0.052 |
| 2.148849375055424 | 1.213 | -0.779 | 0.055 |
| 2.151990967709013 | 1.207 | -0.787 | 0.058 |
| 2.155132560362603 | 1.201 | -0.795 | 0.061 |
| 2.158274153016193 | 1.196 | -0.803 | 0.064 |
| 2.161415745669782 | 1.19 | -0.812 | 0.067 |
| 2.164557338323372 | 1.184 | -0.82 | 0.071 |
| 2.167698930976961 | 1.179 | -0.828 | 0.074 |
| 2.170840523630551 | 1.173 | -0.837 | 0.077 |
| 2.173982116284141 | 1.168 | -0.846 | 0.08 |
| 2.17712370893773 | 1.162 | -0.855 | 0.084 |
| 2.18026530159132 | 1.157 | -0.864 | 0.087 |
| 2.183406894244909 | 1.151 | -0.873 | 0.09 |
| 2.186548486898499 | 1.146 | -0.882 | 0.093 |
| 2.189690079552089 | 1.14 | -0.892 | 0.097 |
| 2.192831672205678 | 1.135 | -0.901 | 0.1 |
| 2.195973264859268 | 1.13 | -0.911 | 0.103 |
| 2.199114857512857 | 1.124 | -0.921 | 0.106 |
| 2.202256450166447 | 1.119 | -0.932 | 0.11 |
| 2.205398042820036 | 1.114 | -0.942 | 0.113 |
| 2.208539635473626 | 1.108 | -0.953 | 0.116 |
| 2.211681228127216 | 1.103 | -0.964 | 0.12 |
| 2.214822820780805 | 1.098 | -0.975 | 0.123 |
| 2.217964413434395 | 1.093 | -0.986 | 0.127 |
| 2.221106006087984 | 1.087 | -0.998 | 0.13 |
| 2.224247598741574 | 1.082 | -1.01 | 0.133 |
| 2.227389191395164 | 1.077 | -1.022 | 0.137 |
| 2.230530784048753 | 1.072 | -1.034 | 0.14 |
| 2.233672376702343 | 1.067 | -1.047 | 0.144 |
| 2.236813969355933 | 1.062 | -1.06 | 0.147 |
| 2.239955562009522 | 1.057 | -1.074 | 0.15 |
| 2.243097154663112 | 1.052 | -1.088 | 0.154 |
| 2.246238747316701 | 1.046 | -1.102 | 0.157 |
| 2.249380339970291 | 1.041 | -1.116 | 0.161 |
| 2.252521932623881 | 1.036 | -1.131 | 0.164 |
| 2.25566352527747 | 1.031 | -1.147 | 0.168 |
| 2.25880511793106 | 1.027 | -1.163 | 0.172 |
| 2.261946710584649 | 1.022 | -1.179 | 0.175 |
| 2.265088303238239 | 1.017 | -1.196 | 0.179 |
| 2.268229895891829 | 1.012 | -1.214 | 0.182 |
| 2.271371488545418 | 1.007 | -1.232 | 0.186 |
| 2.274513081199008 | 1.002 | -1.251 | 0.19 |
| 2.277654673852597 | 0.997 | -1.271 | 0.193 |
| 2.280796266506186 | 0.992 | -1.292 | 0.197 |
| 2.283937859159776 | 0.988 | -1.313 | 0.201 |
| 2.287079451813366 | 0.983 | -1.335 | 0.204 |
| 2.290221044466955 | 0.978 | -1.359 | 0.208 |
| 2.293362637120545 | 0.973 | -1.383 | 0.212 |
| 2.296504229774135 | 0.968 | -1.409 | 0.216 |
| 2.299645822427724 | 0.964 | -1.436 | 0.22 |
| 2.302787415081314 | 0.959 | -1.464 | 0.223 |
| 2.305929007734904 | 0.954 | -1.495 | 0.227 |
| 2.309070600388493 | 0.95 | -1.527 | 0.231 |
| 2.312212193042083 | 0.945 | -1.562 | 0.235 |
| 2.315353785695672 | 0.94 | -1.599 | 0.239 |
| 2.318495378349262 | 0.936 | -1.639 | 0.243 |
| 2.321636971002852 | 0.931 | -1.682 | 0.247 |
| 2.324778563656441 | 0.927 | -1.73 | 0.251 |
| 2.327920156310031 | 0.922 | -1.783 | 0.255 |
| 2.33106174896362 | 0.917 | -1.842 | 0.259 |
| 2.33420334161721 | 0.913 | -1.908 | 0.264 |
| 2.3373449342708 | 0.908 | -1.986 | 0.268 |
| 2.340486526924389 | 0.904 | -2.077 | 0.272 |
| 2.343628119577979 | 0.899 | -2.188 | 0.276 |
| 2.346769712231568 | 0.895 | -2.332 | 0.281 |
| 2.349911304885158 | 0.89 | -2.535 | 0.285 |
| 2.353052897538748 | 0.886 | -2.882 | 0.289 |
| 2.356194490192337 | 0.881 | -100 | 0.294 |
| 2.359336082845927 | 0.877 | -2.882 | 0.298 |
| 2.362477675499516 | 0.873 | -2.535 | 0.303 |
| 2.365619268153106 | 0.868 | -2.332 | 0.307 |
| 2.368760860806696 | 0.864 | -2.188 | 0.312 |
| 2.371902453460285 | 0.859 | -2.077 | 0.317 |
| 2.375044046113875 | 0.855 | -1.986 | 0.321 |
| 2.378185638767464 | 0.851 | -1.908 | 0.326 |
| 2.381327231421054 | 0.846 | -1.842 | 0.331 |
| 2.384468824074644 | 0.842 | -1.783 | 0.336 |
| 2.387610416728233 | 0.838 | -1.73 | 0.341 |
| 2.390752009381823 | 0.833 | -1.682 | 0.345 |
| 2.393893602035412 | 0.829 | -1.639 | 0.351 |
| 2.397035194689002 | 0.825 | -1.599 | 0.356 |
| 2.400176787342591 | 0.82 | -1.562 | 0.361 |
| 2.403318379996181 | 0.816 | -1.527 | 0.366 |
| 2.406459972649771 | 0.812 | -1.495 | 0.371 |
| 2.40960156530336 | 0.808 | -1.464 | 0.377 |
| 2.41274315795695 | 0.804 | -1.436 | 0.382 |
| 2.41588475061054 | 0.799 | -1.409 | 0.387 |
| 2.419026343264129 | 0.795 | -1.383 | 0.393 |
| 2.422167935917719 | 0.791 | -1.359 | 0.399 |
| 2.425309528571308 | 0.787 | -1.335 | 0.404 |
| 2.428451121224898 | 0.783 | -1.313 | 0.41 |
| 2.431592713878488 | 0.778 | -1.292 | 0.416 |
| 2.434734306532077 | 0.774 | -1.271 | 0.422 |
| 2.437875899185667 | 0.77 | -1.251 | 0.428 |
| 2.441017491839256 | 0.766 | -1.232 | 0.434 |
| 2.444159084492846 | 0.762 | -1.214 | 0.44 |
| 2.447300677146435 | 0.758 | -1.196 | 0.447 |
| 2.450442269800025 | 0.754 | -1.179 | 0.453 |
| 2.453583862453615 | 0.75 | -1.163 | 0.46 |
| 2.456725455107204 | 0.746 | -1.147 | 0.466 |
| 2.459867047760794 | 0.742 | -1.131 | 0.473 |
| 2.463008640414384 | 0.738 | -1.116 | 0.48 |
| 2.466150233067973 | 0.734 | -1.102 | 0.487 |
| 2.469291825721563 | 0.73 | -1.088 | 0.495 |
| 2.472433418375152 | 0.726 | -1.074 | 0.502 |
| 2.475575011028742 | 0.722 | -1.06 | 0.509 |
| 2.478716603682332 | 0.718 | -1.047 | 0.517 |
| 2.481858196335921 | 0.714 | -1.034 | 0.525 |
| 2.48499978898951 | 0.71 | -1.022 | 0.533 |
| 2.4881413816431 | 0.706 | -1.01 | 0.541 |
| 2.49128297429669 | 0.702 | -0.998 | 0.549 |
| 2.49442456695028 | 0.698 | -0.986 | 0.558 |
| 2.497566159603869 | 0.694 | -0.975 | 0.567 |
| 2.500707752257458 | 0.69 | -0.964 | 0.576 |
| 2.503849344911048 | 0.686 | -0.953 | 0.585 |
| 2.506990937564638 | 0.682 | -0.942 | 0.594 |
| 2.510132530218228 | 0.678 | -0.932 | 0.604 |
| 2.513274122871817 | 0.674 | -0.921 | 0.614 |
| 2.516415715525407 | 0.67 | -0.911 | 0.625 |
| 2.519557308178996 | 0.667 | -0.901 | 0.635 |
| 2.522698900832586 | 0.663 | -0.892 | 0.646 |
| 2.525840493486176 | 0.659 | -0.882 | 0.657 |
| 2.528982086139765 | 0.655 | -0.873 | 0.669 |
| 2.532123678793355 | 0.651 | -0.864 | 0.681 |
| 2.535265271446944 | 0.647 | -0.855 | 0.694 |
| 2.538406864100534 | 0.643 | -0.846 | 0.707 |
| 2.541548456754124 | 0.64 | -0.837 | 0.72 |
| 2.544690049407713 | 0.636 | -0.828 | 0.735 |
| 2.547831642061302 | 0.632 | -0.82 | 0.749 |
| 2.550973234714892 | 0.628 | -0.812 | 0.765 |
| 2.554114827368482 | 0.625 | -0.803 | 0.781 |
| 2.557256420022072 | 0.621 | -0.795 | 0.798 |
| 2.560398012675661 | 0.617 | -0.787 | 0.815 |
| 2.563539605329251 | 0.613 | -0.779 | 0.834 |
| 2.56668119798284 | 0.609 | -0.772 | 0.854 |
| 2.56982279063643 | 0.606 | -0.764 | 0.875 |
| 2.57296438329002 | 0.602 | -0.757 | 0.898 |
| 2.576105975943609 | 0.598 | -0.749 | 0.922 |
| 2.579247568597199 | 0.595 | -0.742 | 0.948 |
| 2.582389161250788 | 0.591 | -0.735 | 0.976 |
| 2.585530753904377 | 0.587 | -0.727 | 1.007 |
| 2.588672346557967 | 0.583 | -0.72 | 1.041 |
| 2.591813939211557 | 0.58 | -0.713 | 1.079 |
| 2.594955531865147 | 0.576 | -0.707 | 1.122 |
| 2.598097124518736 | 0.572 | -0.7 | 1.17 |
| 2.601238717172326 | 0.569 | -0.693 | 1.228 |
| 2.604380309825915 | 0.565 | -0.686 | 1.297 |
| 2.607521902479505 | 0.561 | -0.68 | 1.385 |
| 2.610663495133095 | 0.558 | -0.673 | 1.503 |
| 2.613805087786684 | 0.554 | -0.667 | 1.69 |
| 2.616946680440274 | 0.551 | -0.661 | 100 |
| 2.620088273093863 | 0.547 | -0.654 | 1.921 |
| 2.623229865747452 | 0.543 | -0.648 | 1.616 |
| 2.626371458401042 | 0.54 | -0.642 | 1.459 |
| 2.629513051054632 | 0.536 | -0.636 | 1.353 |
| 2.632654643708222 | 0.532 | -0.63 | 1.272 |
| 2.635796236361811 | 0.529 | -0.624 | 1.208 |
| 2.638937829015401 | 0.525 | -0.618 | 1.153 |
| 2.642079421668991 | 0.522 | -0.612 | 1.107 |
| 2.64522101432258 | 0.518 | -0.606 | 1.066 |
| 2.64836260697617 | 0.515 | -0.601 | 1.029 |
| 2.651504199629759 | 0.511 | -0.595 | 0.997 |
| 2.654645792283349 | 0.507 | -0.589 | 0.967 |
| 2.657787384936938 | 0.504 | -0.584 | 0.939 |
| 2.660928977590528 | 0.5 | -0.578 | 0.914 |
| 2.664070570244118 | 0.497 | -0.573 | 0.89 |
| 2.667212162897707 | 0.493 | -0.567 | 0.868 |
| 2.670353755551297 | 0.49 | -0.562 | 0.847 |
| 2.673495348204887 | 0.486 | -0.557 | 0.828 |
| 2.676636940858476 | 0.483 | -0.551 | 0.809 |
| 2.679778533512066 | 0.479 | -0.546 | 0.792 |
| 2.682920126165655 | 0.476 | -0.541 | 0.775 |
| 2.686061718819245 | 0.472 | -0.536 | 0.759 |
| 2.689203311472835 | 0.469 | -0.531 | 0.744 |
| 2.692344904126424 | 0.465 | -0.526 | 0.73 |
| 2.695486496780014 | 0.462 | -0.521 | 0.716 |
| 2.698628089433603 | 0.458 | -0.516 | 0.702 |
| 2.701769682087193 | 0.455 | -0.511 | 0.69 |
| 2.704911274740782 | 0.451 | -0.506 | 0.677 |
| 2.708052867394372 | 0.448 | -0.501 | 0.665 |
| 2.711194460047962 | 0.444 | -0.496 | 0.654 |
| 2.714336052701551 | 0.441 | -0.491 | 0.642 |
| 2.717477645355141 | 0.437 | -0.487 | 0.632 |
| 2.720619238008731 | 0.434 | -0.482 | 0.621 |
| 2.72376083066232 | 0.431 | -0.477 | 0.611 |
| 2.72690242331591 | 0.427 | -0.473 | 0.601 |
| 2.730044015969499 | 0.424 | -0.468 | 0.591 |
| 2.733185608623089 | 0.42 | -0.463 | 0.582 |
| 2.736327201276678 | 0.417 | -0.459 | 0.573 |
| 2.739468793930268 | 0.413 | -0.454 | 0.564 |
| 2.742610386583858 | 0.41 | -0.45 | 0.555 |
| 2.745751979237447 | 0.407 | -0.445 | 0.547 |
| 2.748893571891036 | 0.403 | -0.441 | 0.538 |
| 2.752035164544627 | 0.4 | -0.436 | 0.53 |
| 2.755176757198216 | 0.396 | -0.432 | 0.522 |
| 2.758318349851806 | 0.393 | -0.427 | 0.514 |
| 2.761459942505395 | 0.39 | -0.423 | 0.507 |
| 2.764601535158985 | 0.386 | -0.419 | 0.499 |
| 2.767743127812574 | 0.383 | -0.415 | 0.492 |
| 2.770884720466164 | 0.38 | -0.41 | 0.485 |
| 2.774026313119754 | 0.376 | -0.406 | 0.478 |
| 2.777167905773343 | 0.373 | -0.402 | 0.471 |
| 2.780309498426932 | 0.369 | -0.398 | 0.464 |
| 2.783451091080522 | 0.366 | -0.393 | 0.458 |
| 2.786592683734112 | 0.363 | -0.389 | 0.451 |
| 2.789734276387701 | 0.359 | -0.385 | 0.445 |
| 2.792875869041291 | 0.356 | -0.381 | 0.438 |
| 2.796017461694881 | 0.353 | -0.377 | 0.432 |
| 2.79915905434847 | 0.349 | -0.373 | 0.426 |
| 2.80230064700206 | 0.346 | -0.369 | 0.42 |
| 2.80544223965565 | 0.343 | -0.365 | 0.414 |
| 2.808583832309239 | 0.339 | -0.361 | 0.408 |
| 2.811725424962829 | 0.336 | -0.357 | 0.402 |
| 2.814867017616419 | 0.333 | -0.353 | 0.397 |
| 2.818008610270008 | 0.329 | -0.349 | 0.391 |
| 2.821150202923598 | 0.326 | -0.345 | 0.386 |
| 2.824291795577187 | 0.323 | -0.341 | 0.38 |
| 2.827433388230777 | 0.319 | -0.337 | 0.375 |
| 2.830574980884366 | 0.316 | -0.333 | 0.369 |
| 2.833716573537956 | 0.313 | -0.329 | 0.364 |
| 2.836858166191546 | 0.31 | -0.326 | 0.359 |
| 2.839999758845135 | 0.306 | -0.322 | 0.354 |
| 2.843141351498725 | 0.303 | -0.318 | 0.349 |
| 2.846282944152314 | 0.3 | -0.314 | 0.344 |
| 2.849424536805904 | 0.296 | -0.31 | 0.339 |
| 2.852566129459494 | 0.293 | -0.307 | 0.334 |
| 2.855707722113083 | 0.29 | -0.303 | 0.329 |
| 2.858849314766673 | 0.287 | -0.299 | 0.324 |
| 2.861990907420262 | 0.283 | -0.295 | 0.32 |
| 2.865132500073852 | 0.28 | -0.292 | 0.315 |
| 2.868274092727442 | 0.277 | -0.288 | 0.31 |
| 2.871415685381031 | 0.274 | -0.284 | 0.306 |
| 2.874557278034621 | 0.27 | -0.281 | 0.301 |
| 2.87769887068821 | 0.267 | -0.277 | 0.297 |
| 2.8808404633418 | 0.264 | -0.273 | 0.292 |
| 2.88398205599539 | 0.261 | -0.27 | 0.288 |
| 2.88712364864898 | 0.257 | -0.266 | 0.284 |
| 2.890265241302569 | 0.254 | -0.263 | 0.279 |
| 2.893406833956158 | 0.251 | -0.259 | 0.275 |
| 2.896548426609748 | 0.248 | -0.255 | 0.271 |
| 2.899690019263338 | 0.244 | -0.252 | 0.266 |
| 2.902831611916927 | 0.241 | -0.248 | 0.262 |
| 2.905973204570517 | 0.238 | -0.245 | 0.258 |
| 2.909114797224106 | 0.235 | -0.241 | 0.254 |
| 2.912256389877696 | 0.231 | -0.238 | 0.25 |
| 2.915397982531286 | 0.228 | -0.234 | 0.246 |
| 2.918539575184875 | 0.225 | -0.231 | 0.242 |
| 2.921681167838465 | 0.222 | -0.227 | 0.238 |
| 2.924822760492054 | 0.218 | -0.224 | 0.234 |
| 2.927964353145644 | 0.215 | -0.22 | 0.23 |
| 2.931105945799234 | 0.212 | -0.217 | 0.226 |
| 2.934247538452823 | 0.209 | -0.214 | 0.222 |
| 2.937389131106413 | 0.206 | -0.21 | 0.218 |
| 2.940530723760002 | 0.202 | -0.207 | 0.214 |
| 2.943672316413592 | 0.199 | -0.203 | 0.211 |
| 2.946813909067182 | 0.196 | -0.2 | 0.207 |
| 2.949955501720771 | 0.193 | -0.197 | 0.203 |
| 2.953097094374361 | 0.19 | -0.193 | 0.199 |
| 2.95623868702795 | 0.186 | -0.19 | 0.196 |
| 2.95938027968154 | 0.183 | -0.186 | 0.192 |
| 2.96252187233513 | 0.18 | -0.183 | 0.188 |
| 2.965663464988719 | 0.177 | -0.18 | 0.185 |
| 2.968805057642309 | 0.174 | -0.176 | 0.181 |
| 2.971946650295898 | 0.17 | -0.173 | 0.177 |
| 2.975088242949488 | 0.167 | -0.17 | 0.174 |
| 2.978229835603078 | 0.164 | -0.166 | 0.17 |
| 2.981371428256667 | 0.161 | -0.163 | 0.167 |
| 2.984513020910257 | 0.158 | -0.16 | 0.163 |
| 2.987654613563846 | 0.155 | -0.156 | 0.16 |
| 2.990796206217436 | 0.151 | -0.153 | 0.156 |
| 2.993937798871025 | 0.148 | -0.15 | 0.153 |
| 2.997079391524615 | 0.145 | -0.147 | 0.149 |
| 3.000220984178205 | 0.142 | -0.143 | 0.146 |
| 3.003362576831794 | 0.139 | -0.14 | 0.142 |
| 3.006504169485384 | 0.136 | -0.137 | 0.139 |
| 3.009645762138974 | 0.132 | -0.134 | 0.136 |
| 3.012787354792563 | 0.129 | -0.13 | 0.132 |
| 3.015928947446153 | 0.126 | -0.127 | 0.129 |
| 3.019070540099742 | 0.123 | -0.124 | 0.125 |
| 3.022212132753332 | 0.12 | -0.121 | 0.122 |
| 3.025353725406922 | 0.117 | -0.117 | 0.119 |
| 3.028495318060511 | 0.113 | -0.114 | 0.115 |
| 3.031636910714101 | 0.11 | -0.111 | 0.112 |
| 3.03477850336769 | 0.107 | -0.108 | 0.109 |
| 3.03792009602128 | 0.104 | -0.104 | 0.105 |
| 3.04106168867487 | 0.101 | -0.101 | 0.102 |
| 3.04420328132846 | 0.098 | -0.098 | 0.099 |
| 3.047344873982049 | 0.094 | -0.095 | 0.096 |
| 3.050486466635638 | 0.091 | -0.092 | 0.092 |
| 3.053628059289228 | 0.088 | -0.088 | 0.089 |
| 3.056769651942818 | 0.085 | -0.085 | 0.086 |
| 3.059911244596407 | 0.082 | -0.082 | 0.083 |
| 3.063052837249997 | 0.079 | -0.079 | 0.079 |
| 3.066194429903586 | 0.075 | -0.076 | 0.076 |
| 3.069336022557176 | 0.072 | -0.073 | 0.073 |
| 3.072477615210766 | 0.069 | -0.069 | 0.07 |
| 3.075619207864355 | 0.066 | -0.066 | 0.066 |
| 3.078760800517945 | 0.063 | -0.063 | 0.063 |
| 3.081902393171534 | 0.06 | -0.06 | 0.06 |
| 3.085043985825124 | 0.057 | -0.057 | 0.057 |
| 3.088185578478713 | 0.053 | -0.054 | 0.054 |
| 3.091327171132303 | 0.05 | -0.05 | 0.05 |
| 3.094468763785893 | 0.047 | -0.047 | 0.047 |
| 3.097610356439482 | 0.044 | -0.044 | 0.044 |
| 3.100751949093072 | 0.041 | -0.041 | 0.041 |
| 3.103893541746661 | 0.038 | -0.038 | 0.038 |
| 3.107035134400251 | 0.035 | -0.035 | 0.035 |
| 3.110176727053841 | 0.031 | -0.031 | 0.031 |
| 3.11331831970743 | 0.028 | -0.028 | 0.028 |
| 3.11645991236102 | 0.025 | -0.025 | 0.025 |
| 3.11960150501461 | 0.022 | -0.022 | 0.022 |
| 3.122743097668199 | 0.019 | -0.019 | 0.019 |
| 3.125884690321789 | 0.016 | -0.016 | 0.016 |
| 3.129026282975378 | 0.013 | -0.013 | 0.013 |
| 3.132167875628968 | 0.009 | -0.009 | 0.009 |
| 3.135309468282557 | 0.006 | -0.006 | 0.006 |
| 3.138451060936147 | 0.003 | -0.003 | 0.003 |
| 3.141592653589737 | 0 | 0 | 0 |
| 3.144734246243326 | -0.003 | 0.003 | -0.003 |
| 3.147875838896916 | -0.006 | 0.006 | -0.006 |
| 3.151017431550505 | -0.009 | 0.009 | -0.009 |
| 3.154159024204095 | -0.013 | 0.013 | -0.013 |
| 3.157300616857685 | -0.016 | 0.016 | -0.016 |
| 3.160442209511274 | -0.019 | 0.019 | -0.019 |
| 3.163583802164864 | -0.022 | 0.022 | -0.022 |
| 3.166725394818453 | -0.025 | 0.025 | -0.025 |
| 3.169866987472043 | -0.028 | 0.028 | -0.028 |
| 3.173008580125633 | -0.031 | 0.031 | -0.031 |
| 3.176150172779222 | -0.035 | 0.035 | -0.035 |
| 3.179291765432812 | -0.038 | 0.038 | -0.038 |
| 3.182433358086401 | -0.041 | 0.041 | -0.041 |
| 3.185574950739991 | -0.044 | 0.044 | -0.044 |
| 3.188716543393581 | -0.047 | 0.047 | -0.047 |
| 3.19185813604717 | -0.05 | 0.05 | -0.05 |
| 3.19499972870076 | -0.053 | 0.054 | -0.054 |
| 3.198141321354349 | -0.057 | 0.057 | -0.057 |
| 3.20128291400794 | -0.06 | 0.06 | -0.06 |
| 3.204424506661528 | -0.063 | 0.063 | -0.063 |
| 3.207566099315118 | -0.066 | 0.066 | -0.066 |
| 3.210707691968708 | -0.069 | 0.069 | -0.07 |
| 3.213849284622297 | -0.072 | 0.073 | -0.073 |
| 3.216990877275887 | -0.075 | 0.076 | -0.076 |
| 3.220132469929476 | -0.079 | 0.079 | -0.079 |
| 3.223274062583066 | -0.082 | 0.082 | -0.083 |
| 3.226415655236656 | -0.085 | 0.085 | -0.086 |
| 3.229557247890245 | -0.088 | 0.088 | -0.089 |
| 3.232698840543835 | -0.091 | 0.092 | -0.092 |
| 3.235840433197425 | -0.094 | 0.095 | -0.096 |
| 3.238982025851014 | -0.098 | 0.098 | -0.099 |
| 3.242123618504604 | -0.101 | 0.101 | -0.102 |
| 3.245265211158193 | -0.104 | 0.104 | -0.105 |
| 3.248406803811783 | -0.107 | 0.108 | -0.109 |
| 3.251548396465373 | -0.11 | 0.111 | -0.112 |
| 3.254689989118962 | -0.113 | 0.114 | -0.115 |
| 3.257831581772551 | -0.117 | 0.117 | -0.119 |
| 3.260973174426141 | -0.12 | 0.121 | -0.122 |
| 3.26411476707973 | -0.123 | 0.124 | -0.125 |
| 3.267256359733321 | -0.126 | 0.127 | -0.129 |
| 3.27039795238691 | -0.129 | 0.13 | -0.132 |
| 3.2735395450405 | -0.132 | 0.134 | -0.136 |
| 3.276681137694089 | -0.136 | 0.137 | -0.139 |
| 3.279822730347679 | -0.139 | 0.14 | -0.142 |
| 3.282964323001269 | -0.142 | 0.143 | -0.146 |
| 3.286105915654858 | -0.145 | 0.147 | -0.149 |
| 3.289247508308448 | -0.148 | 0.15 | -0.153 |
| 3.292389100962037 | -0.151 | 0.153 | -0.156 |
| 3.295530693615627 | -0.155 | 0.156 | -0.16 |
| 3.298672286269217 | -0.158 | 0.16 | -0.163 |
| 3.301813878922806 | -0.161 | 0.163 | -0.167 |
| 3.304955471576396 | -0.164 | 0.166 | -0.17 |
| 3.308097064229985 | -0.167 | 0.17 | -0.174 |
| 3.311238656883575 | -0.17 | 0.173 | -0.177 |
| 3.314380249537165 | -0.174 | 0.176 | -0.181 |
| 3.317521842190754 | -0.177 | 0.18 | -0.185 |
| 3.320663434844344 | -0.18 | 0.183 | -0.188 |
| 3.323805027497933 | -0.183 | 0.186 | -0.192 |
| 3.326946620151523 | -0.186 | 0.19 | -0.196 |
| 3.330088212805113 | -0.19 | 0.193 | -0.199 |
| 3.333229805458702 | -0.193 | 0.197 | -0.203 |
| 3.336371398112292 | -0.196 | 0.2 | -0.207 |
| 3.339512990765881 | -0.199 | 0.203 | -0.211 |
| 3.342654583419471 | -0.202 | 0.207 | -0.214 |
| 3.345796176073061 | -0.206 | 0.21 | -0.218 |
| 3.34893776872665 | -0.209 | 0.214 | -0.222 |
| 3.35207936138024 | -0.212 | 0.217 | -0.226 |
| 3.355220954033829 | -0.215 | 0.22 | -0.23 |
| 3.358362546687419 | -0.218 | 0.224 | -0.234 |
| 3.361504139341009 | -0.222 | 0.227 | -0.238 |
| 3.364645731994598 | -0.225 | 0.231 | -0.242 |
| 3.367787324648188 | -0.228 | 0.234 | -0.246 |
| 3.370928917301777 | -0.231 | 0.238 | -0.25 |
| 3.374070509955367 | -0.235 | 0.241 | -0.254 |
| 3.377212102608956 | -0.238 | 0.245 | -0.258 |
| 3.380353695262546 | -0.241 | 0.248 | -0.262 |
| 3.383495287916136 | -0.244 | 0.252 | -0.266 |
| 3.386636880569725 | -0.248 | 0.255 | -0.271 |
| 3.389778473223315 | -0.251 | 0.259 | -0.275 |
| 3.392920065876904 | -0.254 | 0.263 | -0.279 |
| 3.396061658530494 | -0.257 | 0.266 | -0.284 |
| 3.399203251184084 | -0.261 | 0.27 | -0.288 |
| 3.402344843837673 | -0.264 | 0.273 | -0.292 |
| 3.405486436491263 | -0.267 | 0.277 | -0.297 |
| 3.408628029144852 | -0.27 | 0.281 | -0.301 |
| 3.411769621798442 | -0.274 | 0.284 | -0.306 |
| 3.414911214452032 | -0.277 | 0.288 | -0.31 |
| 3.418052807105621 | -0.28 | 0.292 | -0.315 |
| 3.421194399759211 | -0.283 | 0.295 | -0.32 |
| 3.4243359924128 | -0.287 | 0.299 | -0.324 |
| 3.42747758506639 | -0.29 | 0.303 | -0.329 |
| 3.43061917771998 | -0.293 | 0.307 | -0.334 |
| 3.433760770373569 | -0.296 | 0.31 | -0.339 |
| 3.436902363027159 | -0.3 | 0.314 | -0.344 |
| 3.440043955680748 | -0.303 | 0.318 | -0.349 |
| 3.443185548334338 | -0.306 | 0.322 | -0.354 |
| 3.446327140987927 | -0.31 | 0.326 | -0.359 |
| 3.449468733641517 | -0.313 | 0.329 | -0.364 |
| 3.452610326295107 | -0.316 | 0.333 | -0.369 |
| 3.455751918948696 | -0.319 | 0.337 | -0.375 |
| 3.458893511602286 | -0.323 | 0.341 | -0.38 |
| 3.462035104255876 | -0.326 | 0.345 | -0.386 |
| 3.465176696909465 | -0.329 | 0.349 | -0.391 |
| 3.468318289563055 | -0.333 | 0.353 | -0.397 |
| 3.471459882216644 | -0.336 | 0.357 | -0.402 |
| 3.474601474870234 | -0.339 | 0.361 | -0.408 |
| 3.477743067523824 | -0.343 | 0.365 | -0.414 |
| 3.480884660177413 | -0.346 | 0.369 | -0.42 |
| 3.484026252831002 | -0.349 | 0.373 | -0.426 |
| 3.487167845484592 | -0.353 | 0.377 | -0.432 |
| 3.490309438138182 | -0.356 | 0.381 | -0.438 |
| 3.493451030791772 | -0.359 | 0.385 | -0.445 |
| 3.496592623445361 | -0.363 | 0.389 | -0.451 |
| 3.499734216098951 | -0.366 | 0.393 | -0.458 |
| 3.50287580875254 | -0.369 | 0.398 | -0.464 |
| 3.50601740140613 | -0.373 | 0.402 | -0.471 |
| 3.50915899405972 | -0.376 | 0.406 | -0.478 |
| 3.512300586713309 | -0.38 | 0.41 | -0.485 |
| 3.515442179366899 | -0.383 | 0.415 | -0.492 |
| 3.518583772020488 | -0.386 | 0.419 | -0.499 |
| 3.521725364674078 | -0.39 | 0.423 | -0.507 |
| 3.524866957327668 | -0.393 | 0.427 | -0.514 |
| 3.528008549981257 | -0.396 | 0.432 | -0.522 |
| 3.531150142634847 | -0.4 | 0.436 | -0.53 |
| 3.534291735288436 | -0.403 | 0.441 | -0.538 |
| 3.537433327942026 | -0.407 | 0.445 | -0.547 |
| 3.540574920595616 | -0.41 | 0.45 | -0.555 |
| 3.543716513249205 | -0.413 | 0.454 | -0.564 |
| 3.546858105902795 | -0.417 | 0.459 | -0.573 |
| 3.549999698556384 | -0.42 | 0.463 | -0.582 |
| 3.553141291209974 | -0.424 | 0.468 | -0.591 |
| 3.556282883863564 | -0.427 | 0.473 | -0.601 |
| 3.559424476517153 | -0.431 | 0.477 | -0.611 |
| 3.562566069170743 | -0.434 | 0.482 | -0.621 |
| 3.565707661824332 | -0.437 | 0.487 | -0.632 |
| 3.568849254477922 | -0.441 | 0.491 | -0.642 |
| 3.571990847131511 | -0.444 | 0.496 | -0.654 |
| 3.575132439785101 | -0.448 | 0.501 | -0.665 |
| 3.578274032438691 | -0.451 | 0.506 | -0.677 |
| 3.58141562509228 | -0.455 | 0.511 | -0.69 |
| 3.58455721774587 | -0.458 | 0.516 | -0.702 |
| 3.58769881039946 | -0.462 | 0.521 | -0.716 |
| 3.590840403053049 | -0.465 | 0.526 | -0.73 |
| 3.593981995706639 | -0.469 | 0.531 | -0.744 |
| 3.597123588360228 | -0.472 | 0.536 | -0.759 |
| 3.600265181013818 | -0.476 | 0.541 | -0.775 |
| 3.603406773667407 | -0.479 | 0.546 | -0.792 |
| 3.606548366320997 | -0.483 | 0.551 | -0.809 |
| 3.609689958974587 | -0.486 | 0.557 | -0.828 |
| 3.612831551628176 | -0.49 | 0.562 | -0.847 |
| 3.615973144281766 | -0.493 | 0.567 | -0.868 |
| 3.619114736935355 | -0.497 | 0.573 | -0.89 |
| 3.622256329588945 | -0.5 | 0.578 | -0.914 |
| 3.625397922242534 | -0.504 | 0.584 | -0.939 |
| 3.628539514896124 | -0.507 | 0.589 | -0.967 |
| 3.631681107549714 | -0.511 | 0.595 | -0.997 |
| 3.634822700203303 | -0.515 | 0.601 | -1.029 |
| 3.637964292856893 | -0.518 | 0.606 | -1.066 |
| 3.641105885510483 | -0.522 | 0.612 | -1.107 |
| 3.644247478164072 | -0.525 | 0.618 | -1.153 |
| 3.647389070817662 | -0.529 | 0.624 | -1.208 |
| 3.650530663471251 | -0.532 | 0.63 | -1.272 |
| 3.653672256124841 | -0.536 | 0.636 | -1.353 |
| 3.656813848778431 | -0.54 | 0.642 | -1.459 |
| 3.65995544143202 | -0.543 | 0.648 | -1.616 |
| 3.66309703408561 | -0.547 | 0.654 | -1.921 |
| 3.666238626739199 | -0.551 | 0.661 | -100 |
| 3.66938021939279 | -0.554 | 0.667 | -1.69 |
| 3.672521812046378 | -0.558 | 0.673 | -1.503 |
| 3.675663404699968 | -0.561 | 0.68 | -1.385 |
| 3.678804997353558 | -0.565 | 0.686 | -1.297 |
| 3.681946590007147 | -0.569 | 0.693 | -1.228 |
| 3.685088182660737 | -0.572 | 0.7 | -1.17 |
| 3.688229775314326 | -0.576 | 0.707 | -1.122 |
| 3.691371367967916 | -0.58 | 0.713 | -1.079 |
| 3.694512960621506 | -0.583 | 0.72 | -1.041 |
| 3.697654553275095 | -0.587 | 0.727 | -1.007 |
| 3.700796145928685 | -0.591 | 0.735 | -0.976 |
| 3.703937738582274 | -0.595 | 0.742 | -0.948 |
| 3.707079331235864 | -0.598 | 0.749 | -0.922 |
| 3.710220923889454 | -0.602 | 0.757 | -0.898 |
| 3.713362516543043 | -0.606 | 0.764 | -0.875 |
| 3.716504109196633 | -0.609 | 0.772 | -0.854 |
| 3.719645701850223 | -0.613 | 0.779 | -0.834 |
| 3.722787294503812 | -0.617 | 0.787 | -0.815 |
| 3.725928887157402 | -0.621 | 0.795 | -0.798 |
| 3.729070479810991 | -0.625 | 0.803 | -0.781 |
| 3.732212072464581 | -0.628 | 0.812 | -0.765 |
| 3.735353665118171 | -0.632 | 0.82 | -0.749 |
| 3.73849525777176 | -0.636 | 0.828 | -0.735 |
| 3.74163685042535 | -0.64 | 0.837 | -0.72 |
| 3.744778443078939 | -0.643 | 0.846 | -0.707 |
| 3.747920035732529 | -0.647 | 0.855 | -0.694 |
| 3.751061628386119 | -0.651 | 0.864 | -0.681 |
| 3.754203221039708 | -0.655 | 0.873 | -0.669 |
| 3.757344813693298 | -0.659 | 0.882 | -0.657 |
| 3.760486406346887 | -0.663 | 0.892 | -0.646 |
| 3.763627999000477 | -0.667 | 0.901 | -0.635 |
| 3.766769591654067 | -0.67 | 0.911 | -0.625 |
| 3.769911184307656 | -0.674 | 0.921 | -0.614 |
| 3.773052776961246 | -0.678 | 0.932 | -0.604 |
| 3.776194369614835 | -0.682 | 0.942 | -0.594 |
| 3.779335962268425 | -0.686 | 0.953 | -0.585 |
| 3.782477554922014 | -0.69 | 0.964 | -0.576 |
| 3.785619147575604 | -0.694 | 0.975 | -0.567 |
| 3.788760740229193 | -0.698 | 0.986 | -0.558 |
| 3.791902332882783 | -0.702 | 0.998 | -0.549 |
| 3.795043925536373 | -0.706 | 1.01 | -0.541 |
| 3.798185518189962 | -0.71 | 1.022 | -0.533 |
| 3.801327110843552 | -0.714 | 1.034 | -0.525 |
| 3.804468703497142 | -0.718 | 1.047 | -0.517 |
| 3.807610296150731 | -0.722 | 1.06 | -0.509 |
| 3.810751888804321 | -0.726 | 1.074 | -0.502 |
| 3.813893481457911 | -0.73 | 1.088 | -0.495 |
| 3.8170350741115 | -0.734 | 1.102 | -0.487 |
| 3.82017666676509 | -0.738 | 1.116 | -0.48 |
| 3.823318259418679 | -0.742 | 1.131 | -0.473 |
| 3.826459852072269 | -0.746 | 1.147 | -0.466 |
| 3.829601444725859 | -0.75 | 1.163 | -0.46 |
| 3.832743037379448 | -0.754 | 1.179 | -0.453 |
| 3.835884630033038 | -0.758 | 1.196 | -0.447 |
| 3.839026222686627 | -0.762 | 1.214 | -0.44 |
| 3.842167815340217 | -0.766 | 1.232 | -0.434 |
| 3.845309407993807 | -0.77 | 1.251 | -0.428 |
| 3.848451000647396 | -0.774 | 1.271 | -0.422 |
| 3.851592593300986 | -0.778 | 1.292 | -0.416 |
| 3.854734185954575 | -0.783 | 1.313 | -0.41 |
| 3.857875778608165 | -0.787 | 1.335 | -0.404 |
| 3.861017371261755 | -0.791 | 1.359 | -0.399 |
| 3.864158963915344 | -0.795 | 1.383 | -0.393 |
| 3.867300556568933 | -0.799 | 1.409 | -0.387 |
| 3.870442149222523 | -0.804 | 1.436 | -0.382 |
| 3.873583741876112 | -0.808 | 1.464 | -0.377 |
| 3.876725334529703 | -0.812 | 1.495 | -0.371 |
| 3.879866927183292 | -0.816 | 1.527 | -0.366 |
| 3.883008519836882 | -0.82 | 1.562 | -0.361 |
| 3.886150112490471 | -0.825 | 1.599 | -0.356 |
| 3.889291705144061 | -0.829 | 1.639 | -0.351 |
| 3.892433297797651 | -0.833 | 1.682 | -0.345 |
| 3.89557489045124 | -0.838 | 1.73 | -0.341 |
| 3.89871648310483 | -0.842 | 1.783 | -0.336 |
| 3.901858075758419 | -0.846 | 1.842 | -0.331 |
| 3.904999668412009 | -0.851 | 1.908 | -0.326 |
| 3.908141261065598 | -0.855 | 1.986 | -0.321 |
| 3.911282853719188 | -0.859 | 2.077 | -0.317 |
| 3.914424446372778 | -0.864 | 2.188 | -0.312 |
| 3.917566039026367 | -0.868 | 2.332 | -0.307 |
| 3.920707631679957 | -0.873 | 2.535 | -0.303 |
| 3.923849224333547 | -0.877 | 2.882 | -0.298 |
| 3.926990816987136 | -0.881 | 100 | -0.294 |
| 3.930132409640726 | -0.886 | 2.882 | -0.289 |
| 3.933274002294315 | -0.89 | 2.535 | -0.285 |
| 3.936415594947905 | -0.895 | 2.332 | -0.281 |
| 3.939557187601495 | -0.899 | 2.188 | -0.276 |
| 3.942698780255084 | -0.904 | 2.077 | -0.272 |
| 3.945840372908674 | -0.908 | 1.986 | -0.268 |
| 3.948981965562263 | -0.913 | 1.908 | -0.264 |
| 3.952123558215853 | -0.917 | 1.842 | -0.259 |
| 3.955265150869442 | -0.922 | 1.783 | -0.255 |
| 3.958406743523032 | -0.927 | 1.73 | -0.251 |
| 3.961548336176622 | -0.931 | 1.682 | -0.247 |
| 3.964689928830211 | -0.936 | 1.639 | -0.243 |
| 3.967831521483801 | -0.94 | 1.599 | -0.239 |
| 3.97097311413739 | -0.945 | 1.562 | -0.235 |
| 3.97411470679098 | -0.95 | 1.527 | -0.231 |
| 3.97725629944457 | -0.954 | 1.495 | -0.227 |
| 3.98039789209816 | -0.959 | 1.464 | -0.223 |
| 3.983539484751749 | -0.964 | 1.436 | -0.22 |
| 3.986681077405338 | -0.968 | 1.409 | -0.216 |
| 3.989822670058928 | -0.973 | 1.383 | -0.212 |
| 3.992964262712517 | -0.978 | 1.359 | -0.208 |
| 3.996105855366107 | -0.983 | 1.335 | -0.204 |
| 3.999247448019697 | -0.988 | 1.313 | -0.201 |
| 4.002389040673287 | -0.992 | 1.292 | -0.197 |
| 4.005530633326877 | -0.997 | 1.271 | -0.193 |
| 4.008672225980466 | -1.002 | 1.251 | -0.19 |
| 4.011813818634056 | -1.007 | 1.232 | -0.186 |
| 4.014955411287645 | -1.012 | 1.214 | -0.182 |
| 4.018097003941234 | -1.017 | 1.196 | -0.179 |
| 4.021238596594824 | -1.022 | 1.179 | -0.175 |
| 4.024380189248414 | -1.027 | 1.163 | -0.172 |
| 4.027521781902004 | -1.031 | 1.147 | -0.168 |
| 4.030663374555593 | -1.036 | 1.131 | -0.164 |
| 4.033804967209183 | -1.041 | 1.116 | -0.161 |
| 4.036946559862773 | -1.046 | 1.102 | -0.157 |
| 4.040088152516362 | -1.052 | 1.088 | -0.154 |
| 4.043229745169951 | -1.057 | 1.074 | -0.15 |
| 4.046371337823541 | -1.062 | 1.06 | -0.147 |
| 4.049512930477131 | -1.067 | 1.047 | -0.144 |
| 4.05265452313072 | -1.072 | 1.034 | -0.14 |
| 4.05579611578431 | -1.077 | 1.022 | -0.137 |
| 4.0589377084379 | -1.082 | 1.01 | -0.133 |
| 4.062079301091489 | -1.087 | 0.998 | -0.13 |
| 4.065220893745079 | -1.093 | 0.986 | -0.127 |
| 4.068362486398668 | -1.098 | 0.975 | -0.123 |
| 4.071504079052258 | -1.103 | 0.964 | -0.12 |
| 4.074645671705848 | -1.108 | 0.953 | -0.116 |
| 4.077787264359437 | -1.114 | 0.942 | -0.113 |
| 4.080928857013027 | -1.119 | 0.932 | -0.11 |
| 4.084070449666616 | -1.124 | 0.921 | -0.106 |
| 4.087212042320206 | -1.13 | 0.911 | -0.103 |
| 4.090353634973795 | -1.135 | 0.901 | -0.1 |
| 4.093495227627385 | -1.14 | 0.892 | -0.097 |
| 4.096636820280975 | -1.146 | 0.882 | -0.093 |
| 4.099778412934564 | -1.151 | 0.873 | -0.09 |
| 4.102920005588154 | -1.157 | 0.864 | -0.087 |
| 4.106061598241744 | -1.162 | 0.855 | -0.084 |
| 4.109203190895333 | -1.168 | 0.846 | -0.08 |
| 4.112344783548923 | -1.173 | 0.837 | -0.077 |
| 4.115486376202512 | -1.179 | 0.828 | -0.074 |
| 4.118627968856102 | -1.184 | 0.82 | -0.071 |
| 4.121769561509692 | -1.19 | 0.812 | -0.067 |
| 4.124911154163281 | -1.196 | 0.803 | -0.064 |
| 4.128052746816871 | -1.201 | 0.795 | -0.061 |
| 4.13119433947046 | -1.207 | 0.787 | -0.058 |
| 4.13433593212405 | -1.213 | 0.779 | -0.055 |
| 4.13747752477764 | -1.219 | 0.772 | -0.052 |
| 4.14061911743123 | -1.224 | 0.764 | -0.048 |
| 4.143760710084818 | -1.23 | 0.757 | -0.045 |
| 4.146902302738408 | -1.236 | 0.749 | -0.042 |
| 4.150043895391998 | -1.242 | 0.742 | -0.039 |
| 4.153185488045588 | -1.248 | 0.735 | -0.036 |
| 4.156327080699177 | -1.254 | 0.727 | -0.033 |
| 4.159468673352766 | -1.26 | 0.72 | -0.029 |
| 4.162610266006356 | -1.266 | 0.713 | -0.026 |
| 4.165751858659946 | -1.272 | 0.707 | -0.023 |
| 4.168893451313535 | -1.278 | 0.7 | -0.02 |
| 4.172035043967125 | -1.284 | 0.693 | -0.017 |
| 4.175176636620715 | -1.29 | 0.686 | -0.014 |
| 4.178318229274304 | -1.296 | 0.68 | -0.01 |
| 4.181459821927894 | -1.302 | 0.673 | -0.007 |
| 4.184601414581484 | -1.309 | 0.667 | -0.004 |
| 4.187743007235073 | -1.315 | 0.661 | -0.001 |
| 4.190884599888663 | -1.321 | 0.654 | 0.002 |
| 4.194026192542252 | -1.327 | 0.648 | 0.005 |
| 4.197167785195842 | -1.334 | 0.642 | 0.008 |
| 4.200309377849432 | -1.34 | 0.636 | 0.012 |
| 4.203450970503021 | -1.347 | 0.63 | 0.015 |
| 4.206592563156611 | -1.353 | 0.624 | 0.018 |
| 4.2097341558102 | -1.36 | 0.618 | 0.021 |
| 4.21287574846379 | -1.366 | 0.612 | 0.024 |
| 4.21601734111738 | -1.373 | 0.606 | 0.027 |
| 4.21915893377097 | -1.379 | 0.601 | 0.03 |
| 4.222300526424559 | -1.386 | 0.595 | 0.034 |
| 4.225442119078148 | -1.393 | 0.589 | 0.037 |
| 4.228583711731738 | -1.399 | 0.584 | 0.04 |
| 4.231725304385327 | -1.406 | 0.578 | 0.043 |
| 4.234866897038917 | -1.413 | 0.573 | 0.046 |
| 4.238008489692506 | -1.42 | 0.567 | 0.049 |
| 4.241150082346096 | -1.427 | 0.562 | 0.053 |
| 4.244291674999685 | -1.434 | 0.557 | 0.056 |
| 4.247433267653276 | -1.441 | 0.551 | 0.059 |
| 4.250574860306865 | -1.448 | 0.546 | 0.062 |
| 4.253716452960455 | -1.455 | 0.541 | 0.065 |
| 4.256858045614044 | -1.462 | 0.536 | 0.069 |
| 4.259999638267634 | -1.469 | 0.531 | 0.072 |
| 4.263141230921224 | -1.476 | 0.526 | 0.075 |
| 4.266282823574813 | -1.484 | 0.521 | 0.078 |
| 4.269424416228403 | -1.491 | 0.516 | 0.081 |
| 4.272566008881992 | -1.498 | 0.511 | 0.085 |
| 4.275707601535582 | -1.506 | 0.506 | 0.088 |
| 4.27884919418917 | -1.513 | 0.501 | 0.091 |
| 4.28199078684276 | -1.521 | 0.496 | 0.094 |
| 4.285132379496351 | -1.528 | 0.491 | 0.098 |
| 4.28827397214994 | -1.536 | 0.487 | 0.101 |
| 4.29141556480353 | -1.543 | 0.482 | 0.104 |
| 4.294557157457119 | -1.551 | 0.477 | 0.108 |
| 4.29769875011071 | -1.559 | 0.473 | 0.111 |
| 4.300840342764299 | -1.567 | 0.468 | 0.114 |
| 4.303981935417888 | -1.575 | 0.463 | 0.118 |
| 4.307123528071478 | -1.583 | 0.459 | 0.121 |
| 4.310265120725067 | -1.591 | 0.454 | 0.124 |
| 4.313406713378657 | -1.599 | 0.45 | 0.128 |
| 4.316548306032247 | -1.607 | 0.445 | 0.131 |
| 4.319689898685836 | -1.615 | 0.441 | 0.134 |
| 4.322831491339426 | -1.623 | 0.436 | 0.138 |
| 4.325973083993015 | -1.631 | 0.432 | 0.141 |
| 4.329114676646605 | -1.64 | 0.427 | 0.145 |
| 4.332256269300195 | -1.648 | 0.423 | 0.148 |
| 4.335397861953784 | -1.657 | 0.419 | 0.152 |
| 4.338539454607374 | -1.665 | 0.415 | 0.155 |
| 4.341681047260963 | -1.674 | 0.41 | 0.159 |
| 4.344822639914553 | -1.683 | 0.406 | 0.162 |
| 4.347964232568143 | -1.691 | 0.402 | 0.166 |
| 4.351105825221732 | -1.7 | 0.398 | 0.169 |
| 4.354247417875322 | -1.709 | 0.393 | 0.173 |
| 4.357389010528911 | -1.718 | 0.389 | 0.176 |
| 4.360530603182501 | -1.727 | 0.385 | 0.18 |
| 4.36367219583609 | -1.736 | 0.381 | 0.184 |
| 4.36681378848968 | -1.746 | 0.377 | 0.187 |
| 4.36995538114327 | -1.755 | 0.373 | 0.191 |
| 4.373096973796859 | -1.764 | 0.369 | 0.194 |
| 4.376238566450449 | -1.774 | 0.365 | 0.198 |
| 4.379380159104038 | -1.783 | 0.361 | 0.202 |
| 4.382521751757628 | -1.793 | 0.357 | 0.206 |
| 4.385663344411217 | -1.803 | 0.353 | 0.209 |
| 4.388804937064807 | -1.813 | 0.349 | 0.213 |
| 4.391946529718397 | -1.823 | 0.345 | 0.217 |
| 4.395088122371987 | -1.833 | 0.341 | 0.221 |
| 4.398229715025576 | -1.843 | 0.337 | 0.225 |
| 4.401371307679165 | -1.853 | 0.333 | 0.229 |
| 4.404512900332755 | -1.863 | 0.329 | 0.233 |
| 4.407654492986345 | -1.874 | 0.326 | 0.237 |
| 4.410796085639934 | -1.884 | 0.322 | 0.241 |
| 4.413937678293524 | -1.895 | 0.318 | 0.245 |
| 4.417079270947114 | -1.906 | 0.314 | 0.249 |
| 4.420220863600703 | -1.916 | 0.31 | 0.253 |
| 4.423362456254293 | -1.927 | 0.307 | 0.257 |
| 4.426504048907883 | -1.938 | 0.303 | 0.261 |
| 4.429645641561472 | -1.95 | 0.299 | 0.265 |
| 4.432787234215062 | -1.961 | 0.295 | 0.269 |
| 4.435928826868651 | -1.972 | 0.292 | 0.273 |
| 4.43907041952224 | -1.984 | 0.288 | 0.278 |
| 4.44221201217583 | -1.996 | 0.284 | 0.282 |
| 4.44535360482942 | -2.008 | 0.281 | 0.286 |
| 4.44849519748301 | -2.02 | 0.277 | 0.291 |
| 4.4516367901366 | -2.032 | 0.273 | 0.295 |
| 4.454778382790188 | -2.044 | 0.27 | 0.3 |
| 4.457919975443779 | -2.056 | 0.266 | 0.304 |
| 4.461061568097368 | -2.069 | 0.263 | 0.309 |
| 4.464203160750958 | -2.082 | 0.259 | 0.313 |
| 4.467344753404547 | -2.094 | 0.255 | 0.318 |
| 4.470486346058137 | -2.107 | 0.252 | 0.323 |
| 4.473627938711726 | -2.121 | 0.248 | 0.328 |
| 4.476769531365316 | -2.134 | 0.245 | 0.332 |
| 4.479911124018905 | -2.148 | 0.241 | 0.337 |
| 4.483052716672495 | -2.161 | 0.238 | 0.342 |
| 4.486194309326085 | -2.175 | 0.234 | 0.347 |
| 4.489335901979674 | -2.189 | 0.231 | 0.352 |
| 4.492477494633264 | -2.204 | 0.227 | 0.357 |
| 4.495619087286854 | -2.218 | 0.224 | 0.362 |
| 4.498760679940443 | -2.233 | 0.22 | 0.368 |
| 4.501902272594033 | -2.248 | 0.217 | 0.373 |
| 4.505043865247622 | -2.263 | 0.214 | 0.378 |
| 4.508185457901212 | -2.278 | 0.21 | 0.384 |
| 4.511327050554801 | -2.294 | 0.207 | 0.389 |
| 4.514468643208391 | -2.31 | 0.203 | 0.395 |
| 4.517610235861981 | -2.326 | 0.2 | 0.4 |
| 4.520751828515571 | -2.342 | 0.197 | 0.406 |
| 4.52389342116916 | -2.359 | 0.193 | 0.412 |
| 4.52703501382275 | -2.376 | 0.19 | 0.418 |
| 4.530176606476339 | -2.393 | 0.186 | 0.424 |
| 4.533318199129928 | -2.41 | 0.183 | 0.43 |
| 4.536459791783518 | -2.428 | 0.18 | 0.436 |
| 4.539601384437108 | -2.446 | 0.176 | 0.442 |
| 4.542742977090698 | -2.465 | 0.173 | 0.449 |
| 4.545884569744287 | -2.484 | 0.17 | 0.455 |
| 4.549026162397876 | -2.503 | 0.166 | 0.462 |
| 4.552167755051466 | -2.522 | 0.163 | 0.469 |
| 4.555309347705056 | -2.542 | 0.16 | 0.476 |
| 4.558450940358646 | -2.562 | 0.156 | 0.483 |
| 4.561592533012235 | -2.583 | 0.153 | 0.49 |
| 4.564734125665825 | -2.604 | 0.15 | 0.497 |
| 4.567875718319415 | -2.626 | 0.147 | 0.504 |
| 4.571017310973004 | -2.648 | 0.143 | 0.512 |
| 4.574158903626594 | -2.67 | 0.14 | 0.52 |
| 4.577300496280183 | -2.693 | 0.137 | 0.528 |
| 4.580442088933772 | -2.717 | 0.134 | 0.536 |
| 4.583583681587362 | -2.741 | 0.13 | 0.544 |
| 4.586725274240952 | -2.766 | 0.127 | 0.552 |
| 4.589866866894542 | -2.791 | 0.124 | 0.561 |
| 4.593008459548131 | -2.817 | 0.121 | 0.57 |
| 4.596150052201721 | -2.844 | 0.117 | 0.579 |
| 4.59929164485531 | -2.872 | 0.114 | 0.588 |
| 4.6024332375089 | -2.9 | 0.111 | 0.598 |
| 4.60557483016249 | -2.929 | 0.108 | 0.608 |
| 4.608716422816079 | -2.959 | 0.104 | 0.618 |
| 4.611858015469668 | -2.99 | 0.101 | 0.628 |
| 4.614999608123258 | -3.021 | 0.098 | 0.639 |
| 4.618141200776848 | -3.054 | 0.095 | 0.65 |
| 4.621282793430437 | -3.088 | 0.092 | 0.661 |
| 4.624424386084027 | -3.123 | 0.088 | 0.673 |
| 4.627565978737617 | -3.16 | 0.085 | 0.685 |
| 4.630707571391206 | -3.198 | 0.082 | 0.698 |
| 4.633849164044795 | -3.237 | 0.079 | 0.711 |
| 4.636990756698386 | -3.278 | 0.076 | 0.725 |
| 4.640132349351975 | -3.32 | 0.073 | 0.739 |
| 4.643273942005564 | -3.365 | 0.069 | 0.754 |
| 4.646415534659154 | -3.411 | 0.066 | 0.77 |
| 4.649557127312744 | -3.46 | 0.063 | 0.786 |
| 4.652698719966334 | -3.511 | 0.06 | 0.803 |
| 4.655840312619923 | -3.566 | 0.057 | 0.822 |
| 4.658981905273513 | -3.623 | 0.054 | 0.841 |
| 4.662123497927102 | -3.683 | 0.05 | 0.861 |
| 4.665265090580692 | -3.748 | 0.047 | 0.883 |
| 4.668406683234282 | -3.817 | 0.044 | 0.906 |
| 4.671548275887871 | -3.891 | 0.041 | 0.93 |
| 4.674689868541461 | -3.971 | 0.038 | 0.957 |
| 4.67783146119505 | -4.058 | 0.035 | 0.986 |
| 4.68097305384864 | -4.154 | 0.031 | 1.018 |
| 4.68411464650223 | -4.259 | 0.028 | 1.053 |
| 4.687256239155819 | -4.377 | 0.025 | 1.093 |
| 4.690397831809409 | -4.51 | 0.022 | 1.137 |
| 4.693539424462998 | -4.664 | 0.019 | 1.189 |
| 4.696681017116588 | -4.847 | 0.016 | 1.249 |
| 4.699822609770177 | -5.07 | 0.013 | 1.324 |
| 4.702964202423767 | -5.358 | 0.009 | 1.42 |
| 4.706105795077356 | -5.763 | 0.006 | 1.555 |
| 4.709247387730946 | -6.456 | 0.003 | 1.786 |
| 4.712388980384535 | -100 | 0 | 100 |
| 4.715530573038126 | -6.456 | -0.003 | 1.786 |
| 4.718672165691715 | -5.763 | -0.006 | 1.555 |
| 4.721813758345305 | -5.358 | -0.009 | 1.42 |
| 4.724955350998894 | -5.07 | -0.013 | 1.324 |
| 4.728096943652484 | -4.847 | -0.016 | 1.249 |
| 4.731238536306074 | -4.664 | -0.019 | 1.189 |
| 4.734380128959663 | -4.51 | -0.022 | 1.137 |
| 4.737521721613253 | -4.377 | -0.025 | 1.093 |
| 4.740663314266842 | -4.259 | -0.028 | 1.053 |
| 4.743804906920432 | -4.154 | -0.031 | 1.018 |
| 4.74694649957402 | -4.058 | -0.035 | 0.986 |
| 4.750088092227611 | -3.971 | -0.038 | 0.957 |
| 4.7532296848812 | -3.891 | -0.041 | 0.93 |
| 4.75637127753479 | -3.817 | -0.044 | 0.906 |
| 4.75951287018838 | -3.748 | -0.047 | 0.883 |
| 4.76265446284197 | -3.683 | -0.05 | 0.861 |
| 4.765796055495559 | -3.623 | -0.054 | 0.841 |
| 4.768937648149149 | -3.566 | -0.057 | 0.822 |
| 4.772079240802738 | -3.511 | -0.06 | 0.803 |
| 4.775220833456327 | -3.46 | -0.063 | 0.786 |
| 4.778362426109917 | -3.411 | -0.066 | 0.77 |
| 4.781504018763507 | -3.365 | -0.069 | 0.754 |
| 4.784645611417097 | -3.32 | -0.073 | 0.739 |
| 4.787787204070686 | -3.278 | -0.076 | 0.725 |
| 4.790928796724275 | -3.237 | -0.079 | 0.711 |
| 4.794070389377865 | -3.198 | -0.082 | 0.698 |
| 4.797211982031455 | -3.16 | -0.085 | 0.685 |
| 4.800353574685045 | -3.123 | -0.088 | 0.673 |
| 4.803495167338634 | -3.088 | -0.092 | 0.661 |
| 4.806636759992224 | -3.054 | -0.095 | 0.65 |
| 4.809778352645814 | -3.021 | -0.098 | 0.639 |
| 4.812919945299403 | -2.99 | -0.101 | 0.628 |
| 4.816061537952993 | -2.959 | -0.104 | 0.618 |
| 4.819203130606582 | -2.929 | -0.108 | 0.608 |
| 4.822344723260172 | -2.9 | -0.111 | 0.598 |
| 4.825486315913761 | -2.872 | -0.114 | 0.588 |
| 4.828627908567351 | -2.844 | -0.117 | 0.579 |
| 4.83176950122094 | -2.817 | -0.121 | 0.57 |
| 4.83491109387453 | -2.791 | -0.124 | 0.561 |
| 4.83805268652812 | -2.766 | -0.127 | 0.552 |
| 4.841194279181709 | -2.741 | -0.13 | 0.544 |
| 4.844335871835299 | -2.717 | -0.134 | 0.536 |
| 4.847477464488889 | -2.693 | -0.137 | 0.528 |
| 4.850619057142478 | -2.67 | -0.14 | 0.52 |
| 4.853760649796068 | -2.648 | -0.143 | 0.512 |
| 4.856902242449657 | -2.626 | -0.147 | 0.504 |
| 4.860043835103247 | -2.604 | -0.15 | 0.497 |
| 4.863185427756837 | -2.583 | -0.153 | 0.49 |
| 4.866327020410426 | -2.562 | -0.156 | 0.483 |
| 4.869468613064015 | -2.542 | -0.16 | 0.476 |
| 4.872610205717605 | -2.522 | -0.163 | 0.469 |
| 4.875751798371195 | -2.503 | -0.166 | 0.462 |
| 4.878893391024784 | -2.484 | -0.17 | 0.455 |
| 4.882034983678374 | -2.465 | -0.173 | 0.449 |
| 4.885176576331964 | -2.446 | -0.176 | 0.442 |
| 4.888318168985553 | -2.428 | -0.18 | 0.436 |
| 4.891459761639143 | -2.41 | -0.183 | 0.43 |
| 4.894601354292733 | -2.393 | -0.186 | 0.424 |
| 4.897742946946322 | -2.376 | -0.19 | 0.418 |
| 4.900884539599912 | -2.359 | -0.193 | 0.412 |
| 4.904026132253501 | -2.342 | -0.197 | 0.406 |
| 4.907167724907091 | -2.326 | -0.2 | 0.4 |
| 4.91030931756068 | -2.31 | -0.203 | 0.395 |
| 4.91345091021427 | -2.294 | -0.207 | 0.389 |
| 4.91659250286786 | -2.278 | -0.21 | 0.384 |
| 4.91973409552145 | -2.263 | -0.214 | 0.378 |
| 4.922875688175039 | -2.248 | -0.217 | 0.373 |
| 4.926017280828628 | -2.233 | -0.22 | 0.368 |
| 4.929158873482218 | -2.218 | -0.224 | 0.362 |
| 4.932300466135808 | -2.204 | -0.227 | 0.357 |
| 4.935442058789397 | -2.189 | -0.231 | 0.352 |
| 4.938583651442987 | -2.175 | -0.234 | 0.347 |
| 4.941725244096576 | -2.161 | -0.238 | 0.342 |
| 4.944866836750166 | -2.148 | -0.241 | 0.337 |
| 4.948008429403755 | -2.134 | -0.245 | 0.332 |
| 4.951150022057345 | -2.121 | -0.248 | 0.328 |
| 4.954291614710935 | -2.107 | -0.252 | 0.323 |
| 4.957433207364524 | -2.094 | -0.255 | 0.318 |
| 4.960574800018114 | -2.082 | -0.259 | 0.313 |
| 4.963716392671704 | -2.069 | -0.263 | 0.309 |
| 4.966857985325293 | -2.056 | -0.266 | 0.304 |
| 4.969999577978883 | -2.044 | -0.27 | 0.3 |
| 4.973141170632472 | -2.032 | -0.273 | 0.295 |
| 4.976282763286062 | -2.02 | -0.277 | 0.291 |
| 4.979424355939651 | -2.008 | -0.281 | 0.286 |
| 4.982565948593241 | -1.996 | -0.284 | 0.282 |
| 4.985707541246831 | -1.984 | -0.288 | 0.278 |
| 4.98884913390042 | -1.972 | -0.292 | 0.273 |
| 4.99199072655401 | -1.961 | -0.295 | 0.269 |
| 4.9951323192076 | -1.95 | -0.299 | 0.265 |
| 4.99827391186119 | -1.938 | -0.303 | 0.261 |
| 5.00141550451478 | -1.927 | -0.307 | 0.257 |
| 5.004557097168369 | -1.916 | -0.31 | 0.253 |
| 5.007698689821958 | -1.906 | -0.314 | 0.249 |
| 5.010840282475548 | -1.895 | -0.318 | 0.245 |
| 5.013981875129137 | -1.884 | -0.322 | 0.241 |
| 5.017123467782727 | -1.874 | -0.326 | 0.237 |
| 5.020265060436317 | -1.863 | -0.329 | 0.233 |
| 5.023406653089906 | -1.853 | -0.333 | 0.229 |
| 5.026548245743496 | -1.843 | -0.337 | 0.225 |
| 5.029689838397085 | -1.833 | -0.341 | 0.221 |
| 5.032831431050674 | -1.823 | -0.345 | 0.217 |
| 5.035973023704264 | -1.813 | -0.349 | 0.213 |
| 5.039114616357854 | -1.803 | -0.353 | 0.209 |
| 5.042256209011444 | -1.793 | -0.357 | 0.206 |
| 5.045397801665033 | -1.783 | -0.361 | 0.202 |
| 5.048539394318622 | -1.774 | -0.365 | 0.198 |
| 5.051680986972213 | -1.764 | -0.369 | 0.194 |
| 5.054822579625802 | -1.755 | -0.373 | 0.191 |
| 5.057964172279392 | -1.746 | -0.377 | 0.187 |
| 5.061105764932981 | -1.736 | -0.381 | 0.184 |
| 5.064247357586571 | -1.727 | -0.385 | 0.18 |
| 5.067388950240161 | -1.718 | -0.389 | 0.176 |
| 5.07053054289375 | -1.709 | -0.393 | 0.173 |
| 5.07367213554734 | -1.7 | -0.398 | 0.169 |
| 5.07681372820093 | -1.691 | -0.402 | 0.166 |
| 5.079955320854519 | -1.683 | -0.406 | 0.162 |
| 5.083096913508108 | -1.674 | -0.41 | 0.159 |
| 5.086238506161698 | -1.665 | -0.415 | 0.155 |
| 5.089380098815288 | -1.657 | -0.419 | 0.152 |
| 5.092521691468877 | -1.648 | -0.423 | 0.148 |
| 5.095663284122466 | -1.64 | -0.427 | 0.145 |
| 5.098804876776057 | -1.631 | -0.432 | 0.141 |
| 5.101946469429646 | -1.623 | -0.436 | 0.138 |
| 5.105088062083236 | -1.615 | -0.441 | 0.134 |
| 5.108229654736825 | -1.607 | -0.445 | 0.131 |
| 5.111371247390415 | -1.599 | -0.45 | 0.128 |
| 5.114512840044005 | -1.591 | -0.454 | 0.124 |
| 5.117654432697594 | -1.583 | -0.459 | 0.121 |
| 5.120796025351184 | -1.575 | -0.463 | 0.118 |
| 5.123937618004773 | -1.567 | -0.468 | 0.114 |
| 5.127079210658363 | -1.559 | -0.473 | 0.111 |
| 5.130220803311953 | -1.551 | -0.477 | 0.108 |
| 5.133362395965542 | -1.543 | -0.482 | 0.104 |
| 5.136503988619131 | -1.536 | -0.487 | 0.101 |
| 5.13964558127272 | -1.528 | -0.491 | 0.098 |
| 5.142787173926311 | -1.521 | -0.496 | 0.094 |
| 5.1459287665799 | -1.513 | -0.501 | 0.091 |
| 5.14907035923349 | -1.506 | -0.506 | 0.088 |
| 5.15221195188708 | -1.498 | -0.511 | 0.085 |
| 5.15535354454067 | -1.491 | -0.516 | 0.081 |
| 5.158495137194259 | -1.484 | -0.521 | 0.078 |
| 5.161636729847848 | -1.476 | -0.526 | 0.075 |
| 5.164778322501438 | -1.469 | -0.531 | 0.072 |
| 5.167919915155028 | -1.462 | -0.536 | 0.069 |
| 5.171061507808617 | -1.455 | -0.541 | 0.065 |
| 5.174203100462206 | -1.448 | -0.546 | 0.062 |
| 5.177344693115796 | -1.441 | -0.551 | 0.059 |
| 5.180486285769386 | -1.434 | -0.557 | 0.056 |
| 5.183627878422976 | -1.427 | -0.562 | 0.053 |
| 5.186769471076565 | -1.42 | -0.567 | 0.049 |
| 5.189911063730155 | -1.413 | -0.573 | 0.046 |
| 5.193052656383744 | -1.406 | -0.578 | 0.043 |
| 5.196194249037334 | -1.399 | -0.584 | 0.04 |
| 5.199335841690924 | -1.393 | -0.589 | 0.037 |
| 5.202477434344513 | -1.386 | -0.595 | 0.034 |
| 5.205619026998103 | -1.379 | -0.601 | 0.03 |
| 5.208760619651692 | -1.373 | -0.606 | 0.027 |
| 5.211902212305282 | -1.366 | -0.612 | 0.024 |
| 5.215043804958871 | -1.36 | -0.618 | 0.021 |
| 5.218185397612461 | -1.353 | -0.624 | 0.018 |
| 5.221326990266051 | -1.347 | -0.63 | 0.015 |
| 5.22446858291964 | -1.34 | -0.636 | 0.012 |
| 5.22761017557323 | -1.334 | -0.642 | 0.008 |
| 5.23075176822682 | -1.327 | -0.648 | 0.005 |
| 5.23389336088041 | -1.321 | -0.654 | 0.002 |
| 5.237034953533999 | -1.315 | -0.661 | -0.001 |
| 5.240176546187588 | -1.309 | -0.667 | -0.004 |
| 5.243318138841178 | -1.302 | -0.673 | -0.007 |
| 5.246459731494767 | -1.296 | -0.68 | -0.01 |
| 5.249601324148357 | -1.29 | -0.686 | -0.014 |
| 5.252742916801947 | -1.284 | -0.693 | -0.017 |
| 5.255884509455536 | -1.278 | -0.7 | -0.02 |
| 5.259026102109125 | -1.272 | -0.707 | -0.023 |
| 5.262167694762715 | -1.266 | -0.713 | -0.026 |
| 5.265309287416305 | -1.26 | -0.72 | -0.029 |
| 5.268450880069895 | -1.254 | -0.727 | -0.033 |
| 5.271592472723484 | -1.248 | -0.735 | -0.036 |
| 5.274734065377074 | -1.242 | -0.742 | -0.039 |
| 5.277875658030664 | -1.236 | -0.749 | -0.042 |
| 5.281017250684253 | -1.23 | -0.757 | -0.045 |
| 5.284158843337843 | -1.224 | -0.764 | -0.048 |
| 5.287300435991432 | -1.219 | -0.772 | -0.052 |
| 5.290442028645022 | -1.213 | -0.779 | -0.055 |
| 5.293583621298612 | -1.207 | -0.787 | -0.058 |
| 5.296725213952201 | -1.201 | -0.795 | -0.061 |
| 5.299866806605791 | -1.196 | -0.803 | -0.064 |
| 5.30300839925938 | -1.19 | -0.812 | -0.067 |
| 5.30614999191297 | -1.184 | -0.82 | -0.071 |
| 5.30929158456656 | -1.179 | -0.828 | -0.074 |
| 5.312433177220149 | -1.173 | -0.837 | -0.077 |
| 5.315574769873739 | -1.168 | -0.846 | -0.08 |
| 5.318716362527328 | -1.162 | -0.855 | -0.084 |
| 5.321857955180918 | -1.157 | -0.864 | -0.087 |
| 5.324999547834508 | -1.151 | -0.873 | -0.09 |
| 5.328141140488097 | -1.146 | -0.882 | -0.093 |
| 5.331282733141686 | -1.14 | -0.892 | -0.097 |
| 5.334424325795276 | -1.135 | -0.901 | -0.1 |
| 5.337565918448866 | -1.13 | -0.911 | -0.103 |
| 5.340707511102456 | -1.124 | -0.921 | -0.106 |
| 5.343849103756045 | -1.119 | -0.932 | -0.11 |
| 5.346990696409634 | -1.114 | -0.942 | -0.113 |
| 5.350132289063224 | -1.108 | -0.953 | -0.116 |
| 5.353273881716814 | -1.103 | -0.964 | -0.12 |
| 5.356415474370403 | -1.098 | -0.975 | -0.123 |
| 5.359557067023993 | -1.093 | -0.986 | -0.127 |
| 5.362698659677583 | -1.087 | -0.998 | -0.13 |
| 5.365840252331172 | -1.082 | -1.01 | -0.133 |
| 5.368981844984762 | -1.077 | -1.022 | -0.137 |
| 5.372123437638351 | -1.072 | -1.034 | -0.14 |
| 5.375265030291941 | -1.067 | -1.047 | -0.144 |
| 5.378406622945531 | -1.062 | -1.06 | -0.147 |
| 5.38154821559912 | -1.057 | -1.074 | -0.15 |
| 5.38468980825271 | -1.052 | -1.088 | -0.154 |
| 5.387831400906299 | -1.046 | -1.102 | -0.157 |
| 5.39097299355989 | -1.041 | -1.116 | -0.161 |
| 5.394114586213479 | -1.036 | -1.131 | -0.164 |
| 5.397256178867068 | -1.031 | -1.147 | -0.168 |
| 5.400397771520657 | -1.027 | -1.163 | -0.172 |
| 5.403539364174247 | -1.022 | -1.179 | -0.175 |
| 5.406680956827837 | -1.017 | -1.196 | -0.179 |
| 5.409822549481426 | -1.012 | -1.214 | -0.182 |
| 5.412964142135016 | -1.007 | -1.232 | -0.186 |
| 5.416105734788605 | -1.002 | -1.251 | -0.19 |
| 5.419247327442195 | -0.997 | -1.271 | -0.193 |
| 5.422388920095785 | -0.992 | -1.292 | -0.197 |
| 5.425530512749375 | -0.988 | -1.313 | -0.201 |
| 5.428672105402964 | -0.983 | -1.335 | -0.204 |
| 5.431813698056554 | -0.978 | -1.359 | -0.208 |
| 5.434955290710143 | -0.973 | -1.383 | -0.212 |
| 5.438096883363733 | -0.968 | -1.409 | -0.216 |
| 5.441238476017322 | -0.964 | -1.436 | -0.22 |
| 5.444380068670912 | -0.959 | -1.464 | -0.223 |
| 5.447521661324502 | -0.954 | -1.495 | -0.227 |
| 5.450663253978091 | -0.95 | -1.527 | -0.231 |
| 5.453804846631681 | -0.945 | -1.562 | -0.235 |
| 5.456946439285271 | -0.94 | -1.599 | -0.239 |
| 5.46008803193886 | -0.936 | -1.639 | -0.243 |
| 5.46322962459245 | -0.931 | -1.682 | -0.247 |
| 5.466371217246039 | -0.927 | -1.73 | -0.251 |
| 5.46951280989963 | -0.922 | -1.783 | -0.255 |
| 5.472654402553218 | -0.917 | -1.842 | -0.259 |
| 5.475795995206808 | -0.913 | -1.908 | -0.264 |
| 5.478937587860398 | -0.908 | -1.986 | -0.268 |
| 5.482079180513987 | -0.904 | -2.077 | -0.272 |
| 5.485220773167577 | -0.899 | -2.188 | -0.276 |
| 5.488362365821166 | -0.895 | -2.332 | -0.281 |
| 5.491503958474756 | -0.89 | -2.535 | -0.285 |
| 5.494645551128346 | -0.886 | -2.882 | -0.289 |
| 5.497787143781935 | -0.881 | -100 | -0.294 |
| 5.500928736435525 | -0.877 | -2.882 | -0.298 |
| 5.504070329089115 | -0.873 | -2.535 | -0.303 |
| 5.507211921742704 | -0.868 | -2.332 | -0.307 |
| 5.510353514396294 | -0.864 | -2.188 | -0.312 |
| 5.513495107049883 | -0.859 | -2.077 | -0.317 |
| 5.516636699703473 | -0.855 | -1.986 | -0.321 |
| 5.519778292357062 | -0.851 | -1.908 | -0.326 |
| 5.522919885010652 | -0.846 | -1.842 | -0.331 |
| 5.526061477664242 | -0.842 | -1.783 | -0.336 |
| 5.529203070317831 | -0.838 | -1.73 | -0.341 |
| 5.532344662971421 | -0.833 | -1.682 | -0.345 |
| 5.535486255625011 | -0.829 | -1.639 | -0.351 |
| 5.5386278482786 | -0.825 | -1.599 | -0.356 |
| 5.54176944093219 | -0.82 | -1.562 | -0.361 |
| 5.544911033585779 | -0.816 | -1.527 | -0.366 |
| 5.54805262623937 | -0.812 | -1.495 | -0.371 |
| 5.551194218892959 | -0.808 | -1.464 | -0.377 |
| 5.554335811546548 | -0.804 | -1.436 | -0.382 |
| 5.557477404200137 | -0.799 | -1.409 | -0.387 |
| 5.560618996853727 | -0.795 | -1.383 | -0.393 |
| 5.563760589507317 | -0.791 | -1.359 | -0.399 |
| 5.566902182160906 | -0.787 | -1.335 | -0.404 |
| 5.570043774814496 | -0.783 | -1.313 | -0.41 |
| 5.573185367468086 | -0.778 | -1.292 | -0.416 |
| 5.576326960121675 | -0.774 | -1.271 | -0.422 |
| 5.579468552775264 | -0.77 | -1.251 | -0.428 |
| 5.582610145428854 | -0.766 | -1.232 | -0.434 |
| 5.585751738082444 | -0.762 | -1.214 | -0.44 |
| 5.588893330736034 | -0.758 | -1.196 | -0.447 |
| 5.592034923389623 | -0.754 | -1.179 | -0.453 |
| 5.595176516043213 | -0.75 | -1.163 | -0.46 |
| 5.598318108696803 | -0.746 | -1.147 | -0.466 |
| 5.601459701350392 | -0.742 | -1.131 | -0.473 |
| 5.604601294003982 | -0.738 | -1.116 | -0.48 |
| 5.607742886657571 | -0.734 | -1.102 | -0.487 |
| 5.610884479311161 | -0.73 | -1.088 | -0.495 |
| 5.61402607196475 | -0.726 | -1.074 | -0.502 |
| 5.61716766461834 | -0.722 | -1.06 | -0.509 |
| 5.62030925727193 | -0.718 | -1.047 | -0.517 |
| 5.623450849925519 | -0.714 | -1.034 | -0.525 |
| 5.626592442579109 | -0.71 | -1.022 | -0.533 |
| 5.629734035232698 | -0.706 | -1.01 | -0.541 |
| 5.632875627886288 | -0.702 | -0.998 | -0.549 |
| 5.636017220539878 | -0.698 | -0.986 | -0.558 |
| 5.639158813193467 | -0.694 | -0.975 | -0.567 |
| 5.642300405847057 | -0.69 | -0.964 | -0.576 |
| 5.645441998500646 | -0.686 | -0.953 | -0.585 |
| 5.648583591154236 | -0.682 | -0.942 | -0.594 |
| 5.651725183807825 | -0.678 | -0.932 | -0.604 |
| 5.654866776461415 | -0.674 | -0.921 | -0.614 |
| 5.658008369115005 | -0.67 | -0.911 | -0.625 |
| 5.661149961768594 | -0.667 | -0.901 | -0.635 |
| 5.664291554422184 | -0.663 | -0.892 | -0.646 |
| 5.667433147075774 | -0.659 | -0.882 | -0.657 |
| 5.670574739729363 | -0.655 | -0.873 | -0.669 |
| 5.673716332382953 | -0.651 | -0.864 | -0.681 |
| 5.676857925036542 | -0.647 | -0.855 | -0.694 |
| 5.679999517690132 | -0.643 | -0.846 | -0.707 |
| 5.683141110343721 | -0.64 | -0.837 | -0.72 |
| 5.686282702997311 | -0.636 | -0.828 | -0.735 |
| 5.689424295650901 | -0.632 | -0.82 | -0.749 |
| 5.69256588830449 | -0.628 | -0.812 | -0.765 |
| 5.69570748095808 | -0.625 | -0.803 | -0.781 |
| 5.69884907361167 | -0.621 | -0.795 | -0.798 |
| 5.701990666265259 | -0.617 | -0.787 | -0.815 |
| 5.705132258918849 | -0.613 | -0.779 | -0.834 |
| 5.708273851572438 | -0.609 | -0.772 | -0.854 |
| 5.711415444226028 | -0.606 | -0.764 | -0.875 |
| 5.714557036879618 | -0.602 | -0.757 | -0.898 |
| 5.717698629533207 | -0.598 | -0.749 | -0.922 |
| 5.720840222186797 | -0.595 | -0.742 | -0.948 |
| 5.723981814840386 | -0.591 | -0.735 | -0.976 |
| 5.727123407493976 | -0.587 | -0.727 | -1.007 |
| 5.730265000147565 | -0.583 | -0.72 | -1.041 |
| 5.733406592801155 | -0.58 | -0.713 | -1.079 |
| 5.736548185454744 | -0.576 | -0.707 | -1.122 |
| 5.739689778108334 | -0.572 | -0.7 | -1.17 |
| 5.742831370761924 | -0.569 | -0.693 | -1.228 |
| 5.745972963415514 | -0.565 | -0.686 | -1.297 |
| 5.749114556069103 | -0.561 | -0.68 | -1.385 |
| 5.752256148722693 | -0.558 | -0.673 | -1.503 |
| 5.755397741376282 | -0.554 | -0.667 | -1.69 |
| 5.758539334029872 | -0.551 | -0.661 | -100 |
| 5.761680926683462 | -0.547 | -0.654 | -1.921 |
| 5.764822519337051 | -0.543 | -0.648 | -1.616 |
| 5.767964111990641 | -0.54 | -0.642 | -1.459 |
| 5.77110570464423 | -0.536 | -0.636 | -1.353 |
| 5.77424729729782 | -0.532 | -0.63 | -1.272 |
| 5.77738888995141 | -0.529 | -0.624 | -1.208 |
| 5.780530482605 | -0.525 | -0.618 | -1.153 |
| 5.783672075258588 | -0.522 | -0.612 | -1.107 |
| 5.786813667912178 | -0.518 | -0.606 | -1.066 |
| 5.789955260565768 | -0.515 | -0.601 | -1.029 |
| 5.793096853219358 | -0.511 | -0.595 | -0.997 |
| 5.796238445872947 | -0.507 | -0.589 | -0.967 |
| 5.799380038526537 | -0.504 | -0.584 | -0.939 |
| 5.802521631180126 | -0.5 | -0.578 | -0.914 |
| 5.805663223833715 | -0.497 | -0.573 | -0.89 |
| 5.808804816487306 | -0.493 | -0.567 | -0.868 |
| 5.811946409140895 | -0.49 | -0.562 | -0.847 |
| 5.815088001794485 | -0.486 | -0.557 | -0.828 |
| 5.818229594448074 | -0.483 | -0.551 | -0.809 |
| 5.821371187101663 | -0.479 | -0.546 | -0.792 |
| 5.824512779755254 | -0.476 | -0.541 | -0.775 |
| 5.827654372408843 | -0.472 | -0.536 | -0.759 |
| 5.830795965062433 | -0.469 | -0.531 | -0.744 |
| 5.833937557716022 | -0.465 | -0.526 | -0.73 |
| 5.837079150369612 | -0.462 | -0.521 | -0.716 |
| 5.840220743023201 | -0.458 | -0.516 | -0.702 |
| 5.843362335676791 | -0.455 | -0.511 | -0.69 |
| 5.846503928330381 | -0.451 | -0.506 | -0.677 |
| 5.84964552098397 | -0.448 | -0.501 | -0.665 |
| 5.85278711363756 | -0.444 | -0.496 | -0.654 |
| 5.85592870629115 | -0.441 | -0.491 | -0.642 |
| 5.85907029894474 | -0.437 | -0.487 | -0.632 |
| 5.862211891598329 | -0.434 | -0.482 | -0.621 |
| 5.865353484251918 | -0.431 | -0.477 | -0.611 |
| 5.868495076905508 | -0.427 | -0.473 | -0.601 |
| 5.871636669559098 | -0.424 | -0.468 | -0.591 |
| 5.874778262212687 | -0.42 | -0.463 | -0.582 |
| 5.877919854866277 | -0.417 | -0.459 | -0.573 |
| 5.881061447519866 | -0.413 | -0.454 | -0.564 |
| 5.884203040173456 | -0.41 | -0.45 | -0.555 |
| 5.887344632827046 | -0.407 | -0.445 | -0.547 |
| 5.890486225480635 | -0.403 | -0.441 | -0.538 |
| 5.893627818134224 | -0.4 | -0.436 | -0.53 |
| 5.896769410787814 | -0.396 | -0.432 | -0.522 |
| 5.899911003441404 | -0.393 | -0.427 | -0.514 |
| 5.903052596094994 | -0.39 | -0.423 | -0.507 |
| 5.906194188748583 | -0.386 | -0.419 | -0.499 |
| 5.909335781402172 | -0.383 | -0.415 | -0.492 |
| 5.912477374055762 | -0.38 | -0.41 | -0.485 |
| 5.915618966709352 | -0.376 | -0.406 | -0.478 |
| 5.918760559362942 | -0.373 | -0.402 | -0.471 |
| 5.921902152016531 | -0.369 | -0.398 | -0.464 |
| 5.92504374467012 | -0.366 | -0.393 | -0.458 |
| 5.92818533732371 | -0.363 | -0.389 | -0.451 |
| 5.9313269299773 | -0.359 | -0.385 | -0.445 |
| 5.93446852263089 | -0.356 | -0.381 | -0.438 |
| 5.93761011528448 | -0.353 | -0.377 | -0.432 |
| 5.940751707938068 | -0.349 | -0.373 | -0.426 |
| 5.943893300591658 | -0.346 | -0.369 | -0.42 |
| 5.947034893245248 | -0.343 | -0.365 | -0.414 |
| 5.950176485898837 | -0.339 | -0.361 | -0.408 |
| 5.953318078552427 | -0.336 | -0.357 | -0.402 |
| 5.956459671206017 | -0.333 | -0.353 | -0.397 |
| 5.959601263859606 | -0.329 | -0.349 | -0.391 |
| 5.962742856513196 | -0.326 | -0.345 | -0.386 |
| 5.965884449166785 | -0.323 | -0.341 | -0.38 |
| 5.969026041820375 | -0.319 | -0.337 | -0.375 |
| 5.972167634473964 | -0.316 | -0.333 | -0.369 |
| 5.975309227127554 | -0.313 | -0.329 | -0.364 |
| 5.978450819781144 | -0.31 | -0.326 | -0.359 |
| 5.981592412434733 | -0.306 | -0.322 | -0.354 |
| 5.984734005088323 | -0.303 | -0.318 | -0.349 |
| 5.987875597741913 | -0.3 | -0.314 | -0.344 |
| 5.991017190395502 | -0.296 | -0.31 | -0.339 |
| 5.994158783049092 | -0.293 | -0.307 | -0.334 |
| 5.997300375702681 | -0.29 | -0.303 | -0.329 |
| 6.000441968356271 | -0.287 | -0.299 | -0.324 |
| 6.003583561009861 | -0.283 | -0.295 | -0.32 |
| 6.00672515366345 | -0.28 | -0.292 | -0.315 |
| 6.00986674631704 | -0.277 | -0.288 | -0.31 |
| 6.01300833897063 | -0.274 | -0.284 | -0.306 |
| 6.01614993162422 | -0.27 | -0.281 | -0.301 |
| 6.019291524277808 | -0.267 | -0.277 | -0.297 |
| 6.022433116931398 | -0.264 | -0.273 | -0.292 |
| 6.025574709584988 | -0.261 | -0.27 | -0.288 |
| 6.028716302238577 | -0.257 | -0.266 | -0.284 |
| 6.031857894892167 | -0.254 | -0.263 | -0.279 |
| 6.034999487545757 | -0.251 | -0.259 | -0.275 |
| 6.038141080199346 | -0.248 | -0.255 | -0.271 |
| 6.041282672852935 | -0.244 | -0.252 | -0.266 |
| 6.044424265506525 | -0.241 | -0.248 | -0.262 |
| 6.047565858160115 | -0.238 | -0.245 | -0.258 |
| 6.050707450813704 | -0.235 | -0.241 | -0.254 |
| 6.053849043467294 | -0.231 | -0.238 | -0.25 |
| 6.056990636120884 | -0.228 | -0.234 | -0.246 |
| 6.060132228774473 | -0.225 | -0.231 | -0.242 |
| 6.063273821428063 | -0.222 | -0.227 | -0.238 |
| 6.066415414081653 | -0.218 | -0.224 | -0.234 |
| 6.069557006735242 | -0.215 | -0.22 | -0.23 |
| 6.072698599388831 | -0.212 | -0.217 | -0.226 |
| 6.07584019204242 | -0.209 | -0.214 | -0.222 |
| 6.078981784696011 | -0.206 | -0.21 | -0.218 |
| 6.082123377349601 | -0.202 | -0.207 | -0.214 |
| 6.08526497000319 | -0.199 | -0.203 | -0.211 |
| 6.08840656265678 | -0.196 | -0.2 | -0.207 |
| 6.09154815531037 | -0.193 | -0.197 | -0.203 |
| 6.094689747963959 | -0.19 | -0.193 | -0.199 |
| 6.097831340617549 | -0.186 | -0.19 | -0.196 |
| 6.100972933271138 | -0.183 | -0.186 | -0.192 |
| 6.104114525924728 | -0.18 | -0.183 | -0.188 |
| 6.107256118578317 | -0.177 | -0.18 | -0.185 |
| 6.110397711231907 | -0.174 | -0.176 | -0.181 |
| 6.113539303885497 | -0.17 | -0.173 | -0.177 |
| 6.116680896539086 | -0.167 | -0.17 | -0.174 |
| 6.119822489192675 | -0.164 | -0.166 | -0.17 |
| 6.122964081846265 | -0.161 | -0.163 | -0.167 |
| 6.126105674499855 | -0.158 | -0.16 | -0.163 |
| 6.129247267153445 | -0.155 | -0.156 | -0.16 |
| 6.132388859807034 | -0.151 | -0.153 | -0.156 |
| 6.135530452460624 | -0.148 | -0.15 | -0.153 |
| 6.138672045114213 | -0.145 | -0.147 | -0.149 |
| 6.141813637767803 | -0.142 | -0.143 | -0.146 |
| 6.144955230421393 | -0.139 | -0.14 | -0.142 |
| 6.148096823074982 | -0.136 | -0.137 | -0.139 |
| 6.151238415728571 | -0.132 | -0.134 | -0.136 |
| 6.154380008382161 | -0.129 | -0.13 | -0.132 |
| 6.157521601035751 | -0.126 | -0.127 | -0.129 |
| 6.16066319368934 | -0.123 | -0.124 | -0.125 |
| 6.16380478634293 | -0.12 | -0.121 | -0.122 |
| 6.16694637899652 | -0.117 | -0.117 | -0.119 |
| 6.170087971650109 | -0.113 | -0.114 | -0.115 |
| 6.173229564303698 | -0.11 | -0.111 | -0.112 |
| 6.176371156957289 | -0.107 | -0.108 | -0.109 |
| 6.179512749610878 | -0.104 | -0.104 | -0.105 |
| 6.182654342264468 | -0.101 | -0.101 | -0.102 |
| 6.185795934918057 | -0.098 | -0.098 | -0.099 |
| 6.188937527571647 | -0.094 | -0.095 | -0.096 |
| 6.192079120225237 | -0.091 | -0.092 | -0.092 |
| 6.195220712878826 | -0.088 | -0.088 | -0.089 |
| 6.198362305532415 | -0.085 | -0.085 | -0.086 |
| 6.201503898186005 | -0.082 | -0.082 | -0.083 |
| 6.204645490839594 | -0.079 | -0.079 | -0.079 |
| 6.207787083493184 | -0.075 | -0.076 | -0.076 |
| 6.210928676146774 | -0.072 | -0.073 | -0.073 |
| 6.214070268800364 | -0.069 | -0.069 | -0.07 |
| 6.217211861453953 | -0.066 | -0.066 | -0.066 |
| 6.220353454107543 | -0.063 | -0.063 | -0.063 |
| 6.223495046761133 | -0.06 | -0.06 | -0.06 |
| 6.226636639414722 | -0.057 | -0.057 | -0.057 |
| 6.229778232068312 | -0.053 | -0.054 | -0.054 |
| 6.232919824721901 | -0.05 | -0.05 | -0.05 |
| 6.236061417375491 | -0.047 | -0.047 | -0.047 |
| 6.23920301002908 | -0.044 | -0.044 | -0.044 |
| 6.24234460268267 | -0.041 | -0.041 | -0.041 |
| 6.24548619533626 | -0.038 | -0.038 | -0.038 |
| 6.24862778798985 | -0.035 | -0.035 | -0.035 |
| 6.251769380643438 | -0.031 | -0.031 | -0.031 |
| 6.254910973297028 | -0.028 | -0.028 | -0.028 |
| 6.258052565950618 | -0.025 | -0.025 | -0.025 |
| 6.261194158604208 | -0.022 | -0.022 | -0.022 |
| 6.264335751257797 | -0.019 | -0.019 | -0.019 |
| 6.267477343911387 | -0.016 | -0.016 | -0.016 |
| 6.270618936564976 | -0.013 | -0.013 | -0.013 |
| 6.273760529218566 | -0.009 | -0.009 | -0.009 |
| 6.276902121872155 | -0.006 | -0.006 | -0.006 |
| 6.280043714525745 | -0.003 | -0.003 | -0.003 |
| 6.283185307179335 | 0 | 0 | 0 |